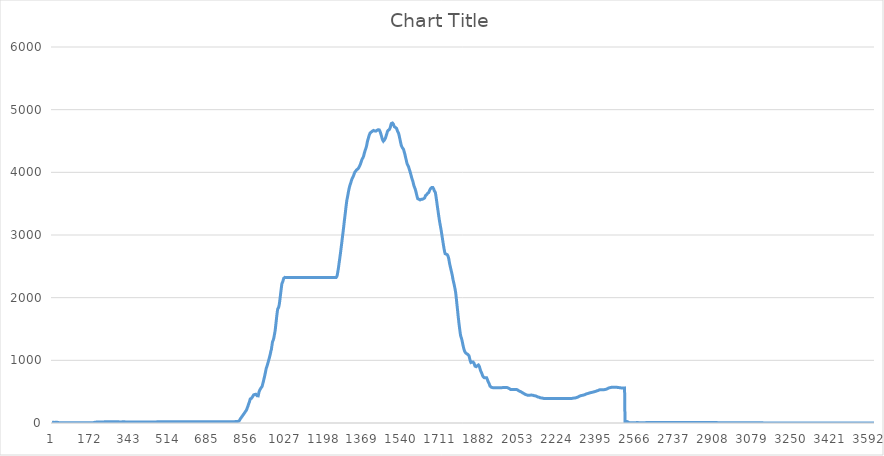
| Category | Series 0 |
|---|---|
| 0 | 10.916 |
| 1 | 10.916 |
| 2 | 10.835 |
| 3 | 11.635 |
| 4 | 10.758 |
| 5 | 10.685 |
| 6 | 9.806 |
| 7 | 9.771 |
| 8 | 9.588 |
| 9 | 9.514 |
| 10 | 9.471 |
| 11 | 9.471 |
| 12 | 9.471 |
| 13 | 9.435 |
| 14 | 10.467 |
| 15 | 11.403 |
| 16 | 11.433 |
| 17 | 12.513 |
| 18 | 13.428 |
| 19 | 13.624 |
| 20 | 13.709 |
| 21 | 13.753 |
| 22 | 13.797 |
| 23 | 13.318 |
| 24 | 12.328 |
| 25 | 8.7 |
| 26 | 7.608 |
| 27 | 5.782 |
| 28 | 5.558 |
| 29 | 5.574 |
| 30 | 5.574 |
| 31 | 4.757 |
| 32 | 5.592 |
| 33 | 5.612 |
| 34 | 4.781 |
| 35 | 4.781 |
| 36 | 4.781 |
| 37 | 5.612 |
| 38 | 4.781 |
| 39 | 4.781 |
| 40 | 4.781 |
| 41 | 4.781 |
| 42 | 4.781 |
| 43 | 4.781 |
| 44 | 4.781 |
| 45 | 4.781 |
| 46 | 4.781 |
| 47 | 4.808 |
| 48 | 4.808 |
| 49 | 4.808 |
| 50 | 4.808 |
| 51 | 4.808 |
| 52 | 4.808 |
| 53 | 4.808 |
| 54 | 4.808 |
| 55 | 4.808 |
| 56 | 4.808 |
| 57 | 4.808 |
| 58 | 4.808 |
| 59 | 4.808 |
| 60 | 4.837 |
| 61 | 4.837 |
| 62 | 4.837 |
| 63 | 4.837 |
| 64 | 4.837 |
| 65 | 4.837 |
| 66 | 4.837 |
| 67 | 4.837 |
| 68 | 4.837 |
| 69 | 4.837 |
| 70 | 4.837 |
| 71 | 4.837 |
| 72 | 4.837 |
| 73 | 4.837 |
| 74 | 4.837 |
| 75 | 4.837 |
| 76 | 4.837 |
| 77 | 4.837 |
| 78 | 4.837 |
| 79 | 4.837 |
| 80 | 4.837 |
| 81 | 4.837 |
| 82 | 4.837 |
| 83 | 4.837 |
| 84 | 4.837 |
| 85 | 4.837 |
| 86 | 4.837 |
| 87 | 4.837 |
| 88 | 4.837 |
| 89 | 4.837 |
| 90 | 4.837 |
| 91 | 4.837 |
| 92 | 4.837 |
| 93 | 4.837 |
| 94 | 4.837 |
| 95 | 4.837 |
| 96 | 4.837 |
| 97 | 4.837 |
| 98 | 4.837 |
| 99 | 4.837 |
| 100 | 4.837 |
| 101 | 4.837 |
| 102 | 4.837 |
| 103 | 4.837 |
| 104 | 4.837 |
| 105 | 4.837 |
| 106 | 4.837 |
| 107 | 4.837 |
| 108 | 4.837 |
| 109 | 4.837 |
| 110 | 4.837 |
| 111 | 4.837 |
| 112 | 4.837 |
| 113 | 4.837 |
| 114 | 4.837 |
| 115 | 4.837 |
| 116 | 4.837 |
| 117 | 4.837 |
| 118 | 4.837 |
| 119 | 4.837 |
| 120 | 4.837 |
| 121 | 4.837 |
| 122 | 4.837 |
| 123 | 4.837 |
| 124 | 4.837 |
| 125 | 4.837 |
| 126 | 4.837 |
| 127 | 4.837 |
| 128 | 4.837 |
| 129 | 4.837 |
| 130 | 4.837 |
| 131 | 4.837 |
| 132 | 4.837 |
| 133 | 4.837 |
| 134 | 4.837 |
| 135 | 4.837 |
| 136 | 4.837 |
| 137 | 4.837 |
| 138 | 4.837 |
| 139 | 4.837 |
| 140 | 4.837 |
| 141 | 4.837 |
| 142 | 4.837 |
| 143 | 4.837 |
| 144 | 4.837 |
| 145 | 4.837 |
| 146 | 4.837 |
| 147 | 4.837 |
| 148 | 4.837 |
| 149 | 4.837 |
| 150 | 4.837 |
| 151 | 4.837 |
| 152 | 4.837 |
| 153 | 4.837 |
| 154 | 4.837 |
| 155 | 4.837 |
| 156 | 4.837 |
| 157 | 4.837 |
| 158 | 4.837 |
| 159 | 4.837 |
| 160 | 4.837 |
| 161 | 4.837 |
| 162 | 4.837 |
| 163 | 4.837 |
| 164 | 4.837 |
| 165 | 4.837 |
| 166 | 4.837 |
| 167 | 4.837 |
| 168 | 4.808 |
| 169 | 4.808 |
| 170 | 4.808 |
| 171 | 4.808 |
| 172 | 4.837 |
| 173 | 4.837 |
| 174 | 4.837 |
| 175 | 4.837 |
| 176 | 4.837 |
| 177 | 4.837 |
| 178 | 4.903 |
| 179 | 5.21 |
| 180 | 5.21 |
| 181 | 6.34 |
| 182 | 6.985 |
| 183 | 6.985 |
| 184 | 8.528 |
| 185 | 9.938 |
| 186 | 11.707 |
| 187 | 11.707 |
| 188 | 12.394 |
| 189 | 13.534 |
| 190 | 13.534 |
| 191 | 14.031 |
| 192 | 14.626 |
| 193 | 14.541 |
| 194 | 14.541 |
| 195 | 14.42 |
| 196 | 14.343 |
| 197 | 14.343 |
| 198 | 14.343 |
| 199 | 15.114 |
| 200 | 15.114 |
| 201 | 15.114 |
| 202 | 15.114 |
| 203 | 15.148 |
| 204 | 15.148 |
| 205 | 15.148 |
| 206 | 15.148 |
| 207 | 15.148 |
| 208 | 15.148 |
| 209 | 15.114 |
| 210 | 15.114 |
| 211 | 16.332 |
| 212 | 16.332 |
| 213 | 16.364 |
| 214 | 16.364 |
| 215 | 16.3 |
| 216 | 16.332 |
| 217 | 16.332 |
| 218 | 16.269 |
| 219 | 16.239 |
| 220 | 16.239 |
| 221 | 16.21 |
| 222 | 17.06 |
| 223 | 17.06 |
| 224 | 17.06 |
| 225 | 17.032 |
| 226 | 17.806 |
| 227 | 17.806 |
| 228 | 17.806 |
| 229 | 17.782 |
| 230 | 18.613 |
| 231 | 18.613 |
| 232 | 18.59 |
| 233 | 18.568 |
| 234 | 18.568 |
| 235 | 18.526 |
| 236 | 18.526 |
| 237 | 18.526 |
| 238 | 18.526 |
| 239 | 18.547 |
| 240 | 18.547 |
| 241 | 18.547 |
| 242 | 18.526 |
| 243 | 18.568 |
| 244 | 18.568 |
| 245 | 19.362 |
| 246 | 19.381 |
| 247 | 20.18 |
| 248 | 20.18 |
| 249 | 20.163 |
| 250 | 20.146 |
| 251 | 20.146 |
| 252 | 20.146 |
| 253 | 20.129 |
| 254 | 20.129 |
| 255 | 20.129 |
| 256 | 20.955 |
| 257 | 20.955 |
| 258 | 20.955 |
| 259 | 20.955 |
| 260 | 20.94 |
| 261 | 20.94 |
| 262 | 20.94 |
| 263 | 20.94 |
| 264 | 20.94 |
| 265 | 20.94 |
| 266 | 20.94 |
| 267 | 20.94 |
| 268 | 20.94 |
| 269 | 20.94 |
| 270 | 20.07 |
| 271 | 20.07 |
| 272 | 20.033 |
| 273 | 19.167 |
| 274 | 19.157 |
| 275 | 19.157 |
| 276 | 20.002 |
| 277 | 20.012 |
| 278 | 20.012 |
| 279 | 20.867 |
| 280 | 20.839 |
| 281 | 20.839 |
| 282 | 19.97 |
| 283 | 19.945 |
| 284 | 19.948 |
| 285 | 19.948 |
| 286 | 19.977 |
| 287 | 20.071 |
| 288 | 20.071 |
| 289 | 19.423 |
| 290 | 18.791 |
| 291 | 18.791 |
| 292 | 18.604 |
| 293 | 17.901 |
| 294 | 17.901 |
| 295 | 17.901 |
| 296 | 17.945 |
| 297 | 17.945 |
| 298 | 17.945 |
| 299 | 17.945 |
| 300 | 17.901 |
| 301 | 17.901 |
| 302 | 17.945 |
| 303 | 17.945 |
| 304 | 17.945 |
| 305 | 17.945 |
| 306 | 17.261 |
| 307 | 18.13 |
| 308 | 18.13 |
| 309 | 18.178 |
| 310 | 18.275 |
| 311 | 18.275 |
| 312 | 18.275 |
| 313 | 18.226 |
| 314 | 18.178 |
| 315 | 18.178 |
| 316 | 18.178 |
| 317 | 18.178 |
| 318 | 18.178 |
| 319 | 18.13 |
| 320 | 18.13 |
| 321 | 18.083 |
| 322 | 18.083 |
| 323 | 18.083 |
| 324 | 17.261 |
| 325 | 17.261 |
| 326 | 17.31 |
| 327 | 17.261 |
| 328 | 17.12 |
| 329 | 17.12 |
| 330 | 17.12 |
| 331 | 17.213 |
| 332 | 17.213 |
| 333 | 17.31 |
| 334 | 17.31 |
| 335 | 17.31 |
| 336 | 17.359 |
| 337 | 17.46 |
| 338 | 17.31 |
| 339 | 17.31 |
| 340 | 17.359 |
| 341 | 16.062 |
| 342 | 16.062 |
| 343 | 16.011 |
| 344 | 15.962 |
| 345 | 15.962 |
| 346 | 15.912 |
| 347 | 15.815 |
| 348 | 15.768 |
| 349 | 15.768 |
| 350 | 15.722 |
| 351 | 15.676 |
| 352 | 15.676 |
| 353 | 15.631 |
| 354 | 15.631 |
| 355 | 15.631 |
| 356 | 15.631 |
| 357 | 15.587 |
| 358 | 15.587 |
| 359 | 15.587 |
| 360 | 15.587 |
| 361 | 15.631 |
| 362 | 15.631 |
| 363 | 15.631 |
| 364 | 15.631 |
| 365 | 14.805 |
| 366 | 14.805 |
| 367 | 14.805 |
| 368 | 14.759 |
| 369 | 14.759 |
| 370 | 14.759 |
| 371 | 14.714 |
| 372 | 14.714 |
| 373 | 14.67 |
| 374 | 14.67 |
| 375 | 14.626 |
| 376 | 14.626 |
| 377 | 14.626 |
| 378 | 14.583 |
| 379 | 14.583 |
| 380 | 14.541 |
| 381 | 14.541 |
| 382 | 14.541 |
| 383 | 14.541 |
| 384 | 14.541 |
| 385 | 14.541 |
| 386 | 14.541 |
| 387 | 14.541 |
| 388 | 14.541 |
| 389 | 14.5 |
| 390 | 14.5 |
| 391 | 14.5 |
| 392 | 14.5 |
| 393 | 14.46 |
| 394 | 14.46 |
| 395 | 14.46 |
| 396 | 14.46 |
| 397 | 14.46 |
| 398 | 14.46 |
| 399 | 14.46 |
| 400 | 14.46 |
| 401 | 14.46 |
| 402 | 14.5 |
| 403 | 14.46 |
| 404 | 14.46 |
| 405 | 14.46 |
| 406 | 14.46 |
| 407 | 14.46 |
| 408 | 14.5 |
| 409 | 14.46 |
| 410 | 14.46 |
| 411 | 14.46 |
| 412 | 14.46 |
| 413 | 14.46 |
| 414 | 14.46 |
| 415 | 14.5 |
| 416 | 14.5 |
| 417 | 14.46 |
| 418 | 14.46 |
| 419 | 14.5 |
| 420 | 14.5 |
| 421 | 14.5 |
| 422 | 14.5 |
| 423 | 14.5 |
| 424 | 14.5 |
| 425 | 14.46 |
| 426 | 14.46 |
| 427 | 14.5 |
| 428 | 14.5 |
| 429 | 14.5 |
| 430 | 14.5 |
| 431 | 14.5 |
| 432 | 14.5 |
| 433 | 14.5 |
| 434 | 14.5 |
| 435 | 14.5 |
| 436 | 14.5 |
| 437 | 14.5 |
| 438 | 14.5 |
| 439 | 14.5 |
| 440 | 14.46 |
| 441 | 14.46 |
| 442 | 14.46 |
| 443 | 14.46 |
| 444 | 14.42 |
| 445 | 14.42 |
| 446 | 14.42 |
| 447 | 14.382 |
| 448 | 14.382 |
| 449 | 14.42 |
| 450 | 15.222 |
| 451 | 15.222 |
| 452 | 15.222 |
| 453 | 15.222 |
| 454 | 16.467 |
| 455 | 16.467 |
| 456 | 16.575 |
| 457 | 17.491 |
| 458 | 17.491 |
| 459 | 17.567 |
| 460 | 18.483 |
| 461 | 18.604 |
| 462 | 18.604 |
| 463 | 19.479 |
| 464 | 19.562 |
| 465 | 19.562 |
| 466 | 19.647 |
| 467 | 19.69 |
| 468 | 19.69 |
| 469 | 19.734 |
| 470 | 19.734 |
| 471 | 19.734 |
| 472 | 19.734 |
| 473 | 19.779 |
| 474 | 19.779 |
| 475 | 19.779 |
| 476 | 19.824 |
| 477 | 19.824 |
| 478 | 19.824 |
| 479 | 19.824 |
| 480 | 19.869 |
| 481 | 19.869 |
| 482 | 19.869 |
| 483 | 19.824 |
| 484 | 19.869 |
| 485 | 19.869 |
| 486 | 19.869 |
| 487 | 19.869 |
| 488 | 19.869 |
| 489 | 19.869 |
| 490 | 19.869 |
| 491 | 19.869 |
| 492 | 19.869 |
| 493 | 19.869 |
| 494 | 19.824 |
| 495 | 19.824 |
| 496 | 19.869 |
| 497 | 19.824 |
| 498 | 19.824 |
| 499 | 19.824 |
| 500 | 19.824 |
| 501 | 19.824 |
| 502 | 19.824 |
| 503 | 19.824 |
| 504 | 19.824 |
| 505 | 19.824 |
| 506 | 19.824 |
| 507 | 19.779 |
| 508 | 19.779 |
| 509 | 19.779 |
| 510 | 19.779 |
| 511 | 18.999 |
| 512 | 18.999 |
| 513 | 18.999 |
| 514 | 19.046 |
| 515 | 19.046 |
| 516 | 19.046 |
| 517 | 19.046 |
| 518 | 19.046 |
| 519 | 19.046 |
| 520 | 19.046 |
| 521 | 19.046 |
| 522 | 19.046 |
| 523 | 19.046 |
| 524 | 19.046 |
| 525 | 19.046 |
| 526 | 19.046 |
| 527 | 19.094 |
| 528 | 19.094 |
| 529 | 19.094 |
| 530 | 19.094 |
| 531 | 19.094 |
| 532 | 19.094 |
| 533 | 19.094 |
| 534 | 19.094 |
| 535 | 19.094 |
| 536 | 19.094 |
| 537 | 19.094 |
| 538 | 19.094 |
| 539 | 19.094 |
| 540 | 19.094 |
| 541 | 19.094 |
| 542 | 19.094 |
| 543 | 19.094 |
| 544 | 19.094 |
| 545 | 19.094 |
| 546 | 19.094 |
| 547 | 19.094 |
| 548 | 19.094 |
| 549 | 19.094 |
| 550 | 19.142 |
| 551 | 19.142 |
| 552 | 19.142 |
| 553 | 19.142 |
| 554 | 19.142 |
| 555 | 19.142 |
| 556 | 19.142 |
| 557 | 19.142 |
| 558 | 19.142 |
| 559 | 19.142 |
| 560 | 19.142 |
| 561 | 19.142 |
| 562 | 19.142 |
| 563 | 19.142 |
| 564 | 19.142 |
| 565 | 19.142 |
| 566 | 19.142 |
| 567 | 19.142 |
| 568 | 19.142 |
| 569 | 19.142 |
| 570 | 19.142 |
| 571 | 19.142 |
| 572 | 19.142 |
| 573 | 19.142 |
| 574 | 19.142 |
| 575 | 19.142 |
| 576 | 19.142 |
| 577 | 19.142 |
| 578 | 19.142 |
| 579 | 19.142 |
| 580 | 19.142 |
| 581 | 19.142 |
| 582 | 19.142 |
| 583 | 19.142 |
| 584 | 19.142 |
| 585 | 19.142 |
| 586 | 19.142 |
| 587 | 19.142 |
| 588 | 19.142 |
| 589 | 19.142 |
| 590 | 18.324 |
| 591 | 18.324 |
| 592 | 18.324 |
| 593 | 18.324 |
| 594 | 18.324 |
| 595 | 18.324 |
| 596 | 18.324 |
| 597 | 19.094 |
| 598 | 19.094 |
| 599 | 19.094 |
| 600 | 19.094 |
| 601 | 19.094 |
| 602 | 19.094 |
| 603 | 19.046 |
| 604 | 19.046 |
| 605 | 19.046 |
| 606 | 18.324 |
| 607 | 18.324 |
| 608 | 18.324 |
| 609 | 18.324 |
| 610 | 18.374 |
| 611 | 18.425 |
| 612 | 18.425 |
| 613 | 18.425 |
| 614 | 18.477 |
| 615 | 18.477 |
| 616 | 18.477 |
| 617 | 18.477 |
| 618 | 18.477 |
| 619 | 18.477 |
| 620 | 18.477 |
| 621 | 18.477 |
| 622 | 18.477 |
| 623 | 18.477 |
| 624 | 18.477 |
| 625 | 18.529 |
| 626 | 18.529 |
| 627 | 18.529 |
| 628 | 18.529 |
| 629 | 18.529 |
| 630 | 18.529 |
| 631 | 18.581 |
| 632 | 18.581 |
| 633 | 18.581 |
| 634 | 18.581 |
| 635 | 18.581 |
| 636 | 18.581 |
| 637 | 18.581 |
| 638 | 18.581 |
| 639 | 18.581 |
| 640 | 18.581 |
| 641 | 18.581 |
| 642 | 18.581 |
| 643 | 18.581 |
| 644 | 18.581 |
| 645 | 18.581 |
| 646 | 18.581 |
| 647 | 18.581 |
| 648 | 18.581 |
| 649 | 18.581 |
| 650 | 18.581 |
| 651 | 18.581 |
| 652 | 18.581 |
| 653 | 18.581 |
| 654 | 18.581 |
| 655 | 18.581 |
| 656 | 18.581 |
| 657 | 18.581 |
| 658 | 18.581 |
| 659 | 18.581 |
| 660 | 18.581 |
| 661 | 18.581 |
| 662 | 18.581 |
| 663 | 18.581 |
| 664 | 18.581 |
| 665 | 18.581 |
| 666 | 18.581 |
| 667 | 18.581 |
| 668 | 18.581 |
| 669 | 18.581 |
| 670 | 18.581 |
| 671 | 18.581 |
| 672 | 18.581 |
| 673 | 18.581 |
| 674 | 18.581 |
| 675 | 18.581 |
| 676 | 18.581 |
| 677 | 18.581 |
| 678 | 18.581 |
| 679 | 18.581 |
| 680 | 18.581 |
| 681 | 18.581 |
| 682 | 18.581 |
| 683 | 18.581 |
| 684 | 18.581 |
| 685 | 18.581 |
| 686 | 18.581 |
| 687 | 18.581 |
| 688 | 18.581 |
| 689 | 18.581 |
| 690 | 18.581 |
| 691 | 18.581 |
| 692 | 18.581 |
| 693 | 18.581 |
| 694 | 18.581 |
| 695 | 18.581 |
| 696 | 18.581 |
| 697 | 18.581 |
| 698 | 18.581 |
| 699 | 18.581 |
| 700 | 18.581 |
| 701 | 18.581 |
| 702 | 18.581 |
| 703 | 18.581 |
| 704 | 18.581 |
| 705 | 18.633 |
| 706 | 18.741 |
| 707 | 18.741 |
| 708 | 18.741 |
| 709 | 18.796 |
| 710 | 18.796 |
| 711 | 18.796 |
| 712 | 18.796 |
| 713 | 18.796 |
| 714 | 18.796 |
| 715 | 18.852 |
| 716 | 18.908 |
| 717 | 18.852 |
| 718 | 18.852 |
| 719 | 18.908 |
| 720 | 18.964 |
| 721 | 18.964 |
| 722 | 19.02 |
| 723 | 18.287 |
| 724 | 18.287 |
| 725 | 18.287 |
| 726 | 18.964 |
| 727 | 18.964 |
| 728 | 18.964 |
| 729 | 18.964 |
| 730 | 18.964 |
| 731 | 18.964 |
| 732 | 18.964 |
| 733 | 18.964 |
| 734 | 19.02 |
| 735 | 19.02 |
| 736 | 19.02 |
| 737 | 19.02 |
| 738 | 19.02 |
| 739 | 19.02 |
| 740 | 19.02 |
| 741 | 19.02 |
| 742 | 19.02 |
| 743 | 19.02 |
| 744 | 19.02 |
| 745 | 19.02 |
| 746 | 19.02 |
| 747 | 19.02 |
| 748 | 19.02 |
| 749 | 19.02 |
| 750 | 19.02 |
| 751 | 19.02 |
| 752 | 19.02 |
| 753 | 19.763 |
| 754 | 19.763 |
| 755 | 19.763 |
| 756 | 19.763 |
| 757 | 19.763 |
| 758 | 19.763 |
| 759 | 19.763 |
| 760 | 19.763 |
| 761 | 19.763 |
| 762 | 19.763 |
| 763 | 19.763 |
| 764 | 19.818 |
| 765 | 19.818 |
| 766 | 19.818 |
| 767 | 19.818 |
| 768 | 19.818 |
| 769 | 19.818 |
| 770 | 19.818 |
| 771 | 19.818 |
| 772 | 19.818 |
| 773 | 19.818 |
| 774 | 19.818 |
| 775 | 19.818 |
| 776 | 19.818 |
| 777 | 19.818 |
| 778 | 19.818 |
| 779 | 19.818 |
| 780 | 19.818 |
| 781 | 19.818 |
| 782 | 19.818 |
| 783 | 19.818 |
| 784 | 19.818 |
| 785 | 19.818 |
| 786 | 19.818 |
| 787 | 19.818 |
| 788 | 19.818 |
| 789 | 19.818 |
| 790 | 19.818 |
| 791 | 19.818 |
| 792 | 19.818 |
| 793 | 19.818 |
| 794 | 19.818 |
| 795 | 19.874 |
| 796 | 19.988 |
| 797 | 19.988 |
| 798 | 20.841 |
| 799 | 20.954 |
| 800 | 20.954 |
| 801 | 21.752 |
| 802 | 22.554 |
| 803 | 23.255 |
| 804 | 23.255 |
| 805 | 23.868 |
| 806 | 24.843 |
| 807 | 24.843 |
| 808 | 25.457 |
| 809 | 25.375 |
| 810 | 25.375 |
| 811 | 25.457 |
| 812 | 24.934 |
| 813 | 24.38 |
| 814 | 24.38 |
| 815 | 24.903 |
| 816 | 26.106 |
| 817 | 26.106 |
| 818 | 28.025 |
| 819 | 31.307 |
| 820 | 31.307 |
| 821 | 36.603 |
| 822 | 42.548 |
| 823 | 48.787 |
| 824 | 48.787 |
| 825 | 55.33 |
| 826 | 68.626 |
| 827 | 75.351 |
| 828 | 75.351 |
| 829 | 81.894 |
| 830 | 88.567 |
| 831 | 95.503 |
| 832 | 95.503 |
| 833 | 102.362 |
| 834 | 109.34 |
| 835 | 109.34 |
| 836 | 116.736 |
| 837 | 122.978 |
| 838 | 129.672 |
| 839 | 129.672 |
| 840 | 135.751 |
| 841 | 142.178 |
| 842 | 142.178 |
| 843 | 156.019 |
| 844 | 163.28 |
| 845 | 170.104 |
| 846 | 170.104 |
| 847 | 177.152 |
| 848 | 183.824 |
| 849 | 190.454 |
| 850 | 190.454 |
| 851 | 198.071 |
| 852 | 205.02 |
| 853 | 205.02 |
| 854 | 219.043 |
| 855 | 232.044 |
| 856 | 241.986 |
| 857 | 247.097 |
| 858 | 254.984 |
| 859 | 267.632 |
| 860 | 281.2 |
| 861 | 293.487 |
| 862 | 307.181 |
| 863 | 315.411 |
| 864 | 323.33 |
| 865 | 332.115 |
| 866 | 340.83 |
| 867 | 357.481 |
| 868 | 372.42 |
| 869 | 383.523 |
| 870 | 390.8 |
| 871 | 392.897 |
| 872 | 392.897 |
| 873 | 392.897 |
| 874 | 392.8 |
| 875 | 396.195 |
| 876 | 402.034 |
| 877 | 407.309 |
| 878 | 412.935 |
| 879 | 417.461 |
| 880 | 423.332 |
| 881 | 430.007 |
| 882 | 436.459 |
| 883 | 443.318 |
| 884 | 448.9 |
| 885 | 451.695 |
| 886 | 452.714 |
| 887 | 453.723 |
| 888 | 455.415 |
| 889 | 456.098 |
| 890 | 457.347 |
| 891 | 462.294 |
| 892 | 463.326 |
| 893 | 460.283 |
| 894 | 458.281 |
| 895 | 456.911 |
| 896 | 454.706 |
| 897 | 450.056 |
| 898 | 442.404 |
| 899 | 434.957 |
| 900 | 434.957 |
| 901 | 428.708 |
| 902 | 424.906 |
| 903 | 424.25 |
| 904 | 433.123 |
| 905 | 450.162 |
| 906 | 469.073 |
| 907 | 486.25 |
| 908 | 499.199 |
| 909 | 508.774 |
| 910 | 516.852 |
| 911 | 525.914 |
| 912 | 532.948 |
| 913 | 539.316 |
| 914 | 545.83 |
| 915 | 552.884 |
| 916 | 559.008 |
| 917 | 563.368 |
| 918 | 566.586 |
| 919 | 568.86 |
| 920 | 574.272 |
| 921 | 583.11 |
| 922 | 594.225 |
| 923 | 609.222 |
| 924 | 625.457 |
| 925 | 638.059 |
| 926 | 651.629 |
| 927 | 667.161 |
| 928 | 683.322 |
| 929 | 698.823 |
| 930 | 713.825 |
| 931 | 727.819 |
| 932 | 744.552 |
| 933 | 761.116 |
| 934 | 779.584 |
| 935 | 796.156 |
| 936 | 814.787 |
| 937 | 833.064 |
| 938 | 850.966 |
| 939 | 866.539 |
| 940 | 881.764 |
| 941 | 894.913 |
| 942 | 900.77 |
| 943 | 912.917 |
| 944 | 924.755 |
| 945 | 937.661 |
| 946 | 949.833 |
| 947 | 962.086 |
| 948 | 975.243 |
| 949 | 988.923 |
| 950 | 1001.543 |
| 951 | 1014.277 |
| 952 | 1027.075 |
| 953 | 1040.724 |
| 954 | 1054.86 |
| 955 | 1069.466 |
| 956 | 1084.127 |
| 957 | 1099.299 |
| 958 | 1116.046 |
| 959 | 1134.532 |
| 960 | 1155.309 |
| 961 | 1167.005 |
| 962 | 1176.635 |
| 963 | 1206.031 |
| 964 | 1229.164 |
| 965 | 1253.355 |
| 966 | 1278.467 |
| 967 | 1297.769 |
| 968 | 1305.938 |
| 969 | 1312.348 |
| 970 | 1322.239 |
| 971 | 1334.331 |
| 972 | 1350.105 |
| 973 | 1367.54 |
| 974 | 1386.568 |
| 975 | 1406.116 |
| 976 | 1425.339 |
| 977 | 1445.899 |
| 978 | 1466.541 |
| 979 | 1494.22 |
| 980 | 1526.216 |
| 981 | 1559.894 |
| 982 | 1592.366 |
| 983 | 1625.89 |
| 984 | 1660.134 |
| 985 | 1692.732 |
| 986 | 1724.628 |
| 987 | 1754.362 |
| 988 | 1782.629 |
| 989 | 1804.253 |
| 990 | 1822.596 |
| 991 | 1830.2 |
| 992 | 1834.736 |
| 993 | 1841.013 |
| 994 | 1851.127 |
| 995 | 1866.09 |
| 996 | 1884.134 |
| 997 | 1908.778 |
| 998 | 1932.491 |
| 999 | 1962.69 |
| 1000 | 1992.354 |
| 1001 | 2022.835 |
| 1002 | 2053.254 |
| 1003 | 2081.628 |
| 1004 | 2112.041 |
| 1005 | 2140.301 |
| 1006 | 2169.488 |
| 1007 | 2198.556 |
| 1008 | 2224.143 |
| 1009 | 2224.143 |
| 1010 | 2240.93 |
| 1011 | 2253.743 |
| 1012 | 2258.832 |
| 1013 | 2271.719 |
| 1014 | 2284.691 |
| 1015 | 2296.834 |
| 1016 | 2309.92 |
| 1017 | 2316.891 |
| 1018 | 2320.501 |
| 1019 | 2320.501 |
| 1020 | 2323.191 |
| 1021 | 2323.916 |
| 1022 | 2325.986 |
| 1023 | 2323.861 |
| 1024 | 2320.869 |
| 1025 | 2320.869 |
| 1026 | 2320.745 |
| 1027 | 2320.914 |
| 1028 | 2320.914 |
| 1029 | 2320.971 |
| 1030 | 2320.971 |
| 1031 | 2320.971 |
| 1032 | 2320.914 |
| 1033 | 2320.914 |
| 1034 | 2320.914 |
| 1035 | 2320.914 |
| 1036 | 2320.914 |
| 1037 | 2320.914 |
| 1038 | 2320.914 |
| 1039 | 2320.914 |
| 1040 | 2320.914 |
| 1041 | 2320.914 |
| 1042 | 2320.914 |
| 1043 | 2320.914 |
| 1044 | 2320.914 |
| 1045 | 2320.914 |
| 1046 | 2320.914 |
| 1047 | 2320.914 |
| 1048 | 2320.914 |
| 1049 | 2320.914 |
| 1050 | 2320.914 |
| 1051 | 2320.914 |
| 1052 | 2320.914 |
| 1053 | 2320.914 |
| 1054 | 2320.914 |
| 1055 | 2320.914 |
| 1056 | 2320.914 |
| 1057 | 2320.858 |
| 1058 | 2320.858 |
| 1059 | 2320.858 |
| 1060 | 2320.858 |
| 1061 | 2320.914 |
| 1062 | 2320.914 |
| 1063 | 2320.914 |
| 1064 | 2320.858 |
| 1065 | 2320.858 |
| 1066 | 2320.858 |
| 1067 | 2320.858 |
| 1068 | 2320.858 |
| 1069 | 2320.858 |
| 1070 | 2320.858 |
| 1071 | 2320.858 |
| 1072 | 2320.858 |
| 1073 | 2320.858 |
| 1074 | 2320.858 |
| 1075 | 2320.858 |
| 1076 | 2320.858 |
| 1077 | 2320.858 |
| 1078 | 2320.858 |
| 1079 | 2320.858 |
| 1080 | 2320.858 |
| 1081 | 2320.858 |
| 1082 | 2320.858 |
| 1083 | 2320.858 |
| 1084 | 2320.858 |
| 1085 | 2320.858 |
| 1086 | 2320.858 |
| 1087 | 2320.858 |
| 1088 | 2320.858 |
| 1089 | 2320.858 |
| 1090 | 2320.858 |
| 1091 | 2320.858 |
| 1092 | 2320.858 |
| 1093 | 2320.858 |
| 1094 | 2320.858 |
| 1095 | 2320.858 |
| 1096 | 2320.858 |
| 1097 | 2320.858 |
| 1098 | 2320.858 |
| 1099 | 2320.858 |
| 1100 | 2320.858 |
| 1101 | 2320.858 |
| 1102 | 2320.858 |
| 1103 | 2320.858 |
| 1104 | 2320.858 |
| 1105 | 2320.858 |
| 1106 | 2320.858 |
| 1107 | 2320.858 |
| 1108 | 2320.858 |
| 1109 | 2320.858 |
| 1110 | 2320.858 |
| 1111 | 2320.858 |
| 1112 | 2320.858 |
| 1113 | 2320.858 |
| 1114 | 2320.858 |
| 1115 | 2320.858 |
| 1116 | 2320.858 |
| 1117 | 2320.858 |
| 1118 | 2320.858 |
| 1119 | 2320.858 |
| 1120 | 2320.858 |
| 1121 | 2320.858 |
| 1122 | 2320.858 |
| 1123 | 2320.858 |
| 1124 | 2320.858 |
| 1125 | 2320.858 |
| 1126 | 2320.858 |
| 1127 | 2320.858 |
| 1128 | 2320.858 |
| 1129 | 2320.858 |
| 1130 | 2320.858 |
| 1131 | 2320.858 |
| 1132 | 2320.858 |
| 1133 | 2320.858 |
| 1134 | 2320.858 |
| 1135 | 2320.858 |
| 1136 | 2320.858 |
| 1137 | 2320.858 |
| 1138 | 2320.858 |
| 1139 | 2320.858 |
| 1140 | 2320.858 |
| 1141 | 2320.858 |
| 1142 | 2320.858 |
| 1143 | 2320.858 |
| 1144 | 2320.858 |
| 1145 | 2320.858 |
| 1146 | 2320.858 |
| 1147 | 2320.801 |
| 1148 | 2320.801 |
| 1149 | 2320.801 |
| 1150 | 2320.801 |
| 1151 | 2320.801 |
| 1152 | 2320.801 |
| 1153 | 2320.801 |
| 1154 | 2320.801 |
| 1155 | 2320.801 |
| 1156 | 2320.801 |
| 1157 | 2320.801 |
| 1158 | 2320.801 |
| 1159 | 2320.801 |
| 1160 | 2320.801 |
| 1161 | 2320.801 |
| 1162 | 2320.801 |
| 1163 | 2320.801 |
| 1164 | 2320.801 |
| 1165 | 2320.801 |
| 1166 | 2320.801 |
| 1167 | 2320.801 |
| 1168 | 2320.801 |
| 1169 | 2320.801 |
| 1170 | 2320.801 |
| 1171 | 2320.801 |
| 1172 | 2320.801 |
| 1173 | 2320.801 |
| 1174 | 2320.801 |
| 1175 | 2320.801 |
| 1176 | 2320.801 |
| 1177 | 2320.801 |
| 1178 | 2320.801 |
| 1179 | 2320.801 |
| 1180 | 2320.801 |
| 1181 | 2320.801 |
| 1182 | 2320.801 |
| 1183 | 2320.801 |
| 1184 | 2320.801 |
| 1185 | 2320.801 |
| 1186 | 2320.801 |
| 1187 | 2320.801 |
| 1188 | 2320.801 |
| 1189 | 2320.801 |
| 1190 | 2320.801 |
| 1191 | 2320.801 |
| 1192 | 2320.801 |
| 1193 | 2320.801 |
| 1194 | 2320.801 |
| 1195 | 2320.801 |
| 1196 | 2320.801 |
| 1197 | 2320.801 |
| 1198 | 2320.801 |
| 1199 | 2320.801 |
| 1200 | 2320.801 |
| 1201 | 2320.801 |
| 1202 | 2320.801 |
| 1203 | 2320.801 |
| 1204 | 2320.801 |
| 1205 | 2320.801 |
| 1206 | 2320.801 |
| 1207 | 2320.801 |
| 1208 | 2320.801 |
| 1209 | 2320.801 |
| 1210 | 2320.801 |
| 1211 | 2320.801 |
| 1212 | 2320.801 |
| 1213 | 2320.801 |
| 1214 | 2320.801 |
| 1215 | 2320.801 |
| 1216 | 2320.801 |
| 1217 | 2320.801 |
| 1218 | 2320.801 |
| 1219 | 2320.801 |
| 1220 | 2320.801 |
| 1221 | 2320.801 |
| 1222 | 2320.801 |
| 1223 | 2320.801 |
| 1224 | 2320.801 |
| 1225 | 2320.801 |
| 1226 | 2320.801 |
| 1227 | 2320.801 |
| 1228 | 2320.801 |
| 1229 | 2320.801 |
| 1230 | 2320.801 |
| 1231 | 2320.801 |
| 1232 | 2320.801 |
| 1233 | 2320.801 |
| 1234 | 2320.801 |
| 1235 | 2320.801 |
| 1236 | 2320.801 |
| 1237 | 2320.801 |
| 1238 | 2321.365 |
| 1239 | 2322.322 |
| 1240 | 2322.838 |
| 1241 | 2322.614 |
| 1242 | 2322.154 |
| 1243 | 2322.487 |
| 1244 | 2322.032 |
| 1245 | 2322.074 |
| 1246 | 2323.059 |
| 1247 | 2325.984 |
| 1248 | 2330.123 |
| 1249 | 2339.953 |
| 1250 | 2347.009 |
| 1251 | 2364.303 |
| 1252 | 2386.088 |
| 1253 | 2406.937 |
| 1254 | 2431.141 |
| 1255 | 2452.139 |
| 1256 | 2474.363 |
| 1257 | 2501.513 |
| 1258 | 2529.109 |
| 1259 | 2556.633 |
| 1260 | 2583.152 |
| 1261 | 2608.736 |
| 1262 | 2634.467 |
| 1263 | 2660.445 |
| 1264 | 2688.405 |
| 1265 | 2715.124 |
| 1266 | 2744.348 |
| 1267 | 2773.79 |
| 1268 | 2802.018 |
| 1269 | 2831.089 |
| 1270 | 2859.275 |
| 1271 | 2889.119 |
| 1272 | 2922.613 |
| 1273 | 2952.507 |
| 1274 | 2983.176 |
| 1275 | 3010.988 |
| 1276 | 3040.159 |
| 1277 | 3069.845 |
| 1278 | 3101.155 |
| 1279 | 3131.955 |
| 1280 | 3163.426 |
| 1281 | 3197.545 |
| 1282 | 3228.813 |
| 1283 | 3259.128 |
| 1284 | 3289.559 |
| 1285 | 3320.431 |
| 1286 | 3350.059 |
| 1287 | 3382.826 |
| 1288 | 3415.301 |
| 1289 | 3445.896 |
| 1290 | 3475.417 |
| 1291 | 3505.184 |
| 1292 | 3532.999 |
| 1293 | 3556.741 |
| 1294 | 3577.138 |
| 1295 | 3594.706 |
| 1296 | 3613.014 |
| 1297 | 3631.746 |
| 1298 | 3651.289 |
| 1299 | 3672.901 |
| 1300 | 3691.939 |
| 1301 | 3710.033 |
| 1302 | 3727.755 |
| 1303 | 3744.291 |
| 1304 | 3760.475 |
| 1305 | 3776.17 |
| 1306 | 3787.251 |
| 1307 | 3798.095 |
| 1308 | 3810.507 |
| 1309 | 3823.151 |
| 1310 | 3833.336 |
| 1311 | 3844.209 |
| 1312 | 3856.363 |
| 1313 | 3869.649 |
| 1314 | 3882.094 |
| 1315 | 3893.022 |
| 1316 | 3900.757 |
| 1317 | 3906.925 |
| 1318 | 3913.171 |
| 1319 | 3919.705 |
| 1320 | 3927.104 |
| 1321 | 3935.572 |
| 1322 | 3945.314 |
| 1323 | 3955.04 |
| 1324 | 3964.93 |
| 1325 | 3975.429 |
| 1326 | 3985.622 |
| 1327 | 3995.041 |
| 1328 | 4002.847 |
| 1329 | 4008.522 |
| 1330 | 4013.304 |
| 1331 | 4018.299 |
| 1332 | 4022.556 |
| 1333 | 4026.546 |
| 1334 | 4030.522 |
| 1335 | 4035.702 |
| 1336 | 4040.44 |
| 1337 | 4042.356 |
| 1338 | 4046.276 |
| 1339 | 4049.332 |
| 1340 | 4052.057 |
| 1341 | 4053.147 |
| 1342 | 4056.173 |
| 1343 | 4061.37 |
| 1344 | 4068.163 |
| 1345 | 4073.987 |
| 1346 | 4081.141 |
| 1347 | 4087.781 |
| 1348 | 4094.374 |
| 1349 | 4102.492 |
| 1350 | 4112.023 |
| 1351 | 4120.736 |
| 1352 | 4127.094 |
| 1353 | 4135.618 |
| 1354 | 4146.689 |
| 1355 | 4159.104 |
| 1356 | 4170.161 |
| 1357 | 4181.375 |
| 1358 | 4192.449 |
| 1359 | 4202.018 |
| 1360 | 4209.832 |
| 1361 | 4218.137 |
| 1362 | 4223.21 |
| 1363 | 4231.116 |
| 1364 | 4237.333 |
| 1365 | 4244.974 |
| 1366 | 4255.971 |
| 1367 | 4270.354 |
| 1368 | 4282.582 |
| 1369 | 4297.039 |
| 1370 | 4311.776 |
| 1371 | 4323.582 |
| 1372 | 4336.557 |
| 1373 | 4350.54 |
| 1374 | 4360.885 |
| 1375 | 4369.507 |
| 1376 | 4378.716 |
| 1377 | 4389.399 |
| 1378 | 4402.655 |
| 1379 | 4416.64 |
| 1380 | 4433.62 |
| 1381 | 4453.103 |
| 1382 | 4472.464 |
| 1383 | 4489.829 |
| 1384 | 4504.139 |
| 1385 | 4519.207 |
| 1386 | 4528.452 |
| 1387 | 4541.709 |
| 1388 | 4555.213 |
| 1389 | 4569.672 |
| 1390 | 4581.317 |
| 1391 | 4592.126 |
| 1392 | 4600.678 |
| 1393 | 4610.775 |
| 1394 | 4619.618 |
| 1395 | 4627.963 |
| 1396 | 4634.98 |
| 1397 | 4639.207 |
| 1398 | 4640.783 |
| 1399 | 4640.755 |
| 1400 | 4642.764 |
| 1401 | 4645.497 |
| 1402 | 4650.58 |
| 1403 | 4652.295 |
| 1404 | 4657.145 |
| 1405 | 4657.313 |
| 1406 | 4660.458 |
| 1407 | 4667.995 |
| 1408 | 4669.129 |
| 1409 | 4669.965 |
| 1410 | 4668.404 |
| 1411 | 4663.664 |
| 1412 | 4664.901 |
| 1413 | 4668.057 |
| 1414 | 4663.884 |
| 1415 | 4659.781 |
| 1416 | 4657.23 |
| 1417 | 4656.099 |
| 1418 | 4656.226 |
| 1419 | 4656.679 |
| 1420 | 4657.5 |
| 1421 | 4657.76 |
| 1422 | 4659.712 |
| 1423 | 4660.625 |
| 1424 | 4665.674 |
| 1425 | 4669.831 |
| 1426 | 4674.547 |
| 1427 | 4679.219 |
| 1428 | 4678.593 |
| 1429 | 4678.896 |
| 1430 | 4678.903 |
| 1431 | 4681.134 |
| 1432 | 4681.277 |
| 1433 | 4680.205 |
| 1434 | 4677.802 |
| 1435 | 4677.247 |
| 1436 | 4672.736 |
| 1437 | 4667.218 |
| 1438 | 4656.575 |
| 1439 | 4647.772 |
| 1440 | 4636.742 |
| 1441 | 4623.921 |
| 1442 | 4612.791 |
| 1443 | 4600.84 |
| 1444 | 4587.132 |
| 1445 | 4574.291 |
| 1446 | 4561.194 |
| 1447 | 4547.789 |
| 1448 | 4535.011 |
| 1449 | 4523.661 |
| 1450 | 4514.709 |
| 1451 | 4505.999 |
| 1452 | 4500.014 |
| 1453 | 4497.135 |
| 1454 | 4496.885 |
| 1455 | 4501.883 |
| 1456 | 4507.382 |
| 1457 | 4513.064 |
| 1458 | 4517.86 |
| 1459 | 4522.749 |
| 1460 | 4529.847 |
| 1461 | 4537.021 |
| 1462 | 4545.562 |
| 1463 | 4556.47 |
| 1464 | 4567.798 |
| 1465 | 4579.715 |
| 1466 | 4592.114 |
| 1467 | 4605.868 |
| 1468 | 4616.188 |
| 1469 | 4627.116 |
| 1470 | 4640.093 |
| 1471 | 4652.544 |
| 1472 | 4663.06 |
| 1473 | 4666.182 |
| 1474 | 4669.511 |
| 1475 | 4670.694 |
| 1476 | 4671.544 |
| 1477 | 4673.033 |
| 1478 | 4676.815 |
| 1479 | 4681.817 |
| 1480 | 4686.837 |
| 1481 | 4693.237 |
| 1482 | 4702.492 |
| 1483 | 4713.597 |
| 1484 | 4726.88 |
| 1485 | 4742.666 |
| 1486 | 4758.938 |
| 1487 | 4770.667 |
| 1488 | 4779.177 |
| 1489 | 4783.632 |
| 1490 | 4785.818 |
| 1491 | 4786.529 |
| 1492 | 4786.879 |
| 1493 | 4787.104 |
| 1494 | 4787.038 |
| 1495 | 4784.593 |
| 1496 | 4779.032 |
| 1497 | 4769.388 |
| 1498 | 4758.077 |
| 1499 | 4745.875 |
| 1500 | 4735.702 |
| 1501 | 4729.151 |
| 1502 | 4728.388 |
| 1503 | 4727.624 |
| 1504 | 4726.523 |
| 1505 | 4721.957 |
| 1506 | 4716.998 |
| 1507 | 4714.557 |
| 1508 | 4714.585 |
| 1509 | 4713.401 |
| 1510 | 4708.728 |
| 1511 | 4700.342 |
| 1512 | 4689.464 |
| 1513 | 4678.536 |
| 1514 | 4667.133 |
| 1515 | 4658.195 |
| 1516 | 4650.353 |
| 1517 | 4643.413 |
| 1518 | 4636.852 |
| 1519 | 4630.366 |
| 1520 | 4619.612 |
| 1521 | 4606.062 |
| 1522 | 4590.168 |
| 1523 | 4573.92 |
| 1524 | 4557.029 |
| 1525 | 4539.949 |
| 1526 | 4522.906 |
| 1527 | 4506.146 |
| 1528 | 4488.367 |
| 1529 | 4471.203 |
| 1530 | 4455.062 |
| 1531 | 4439.179 |
| 1532 | 4425.251 |
| 1533 | 4415.704 |
| 1534 | 4409.261 |
| 1535 | 4400.837 |
| 1536 | 4394.079 |
| 1537 | 4388.26 |
| 1538 | 4386.661 |
| 1539 | 4384.483 |
| 1540 | 4379.654 |
| 1541 | 4369.909 |
| 1542 | 4358.624 |
| 1543 | 4346.234 |
| 1544 | 4333.06 |
| 1545 | 4319.942 |
| 1546 | 4308.419 |
| 1547 | 4294.209 |
| 1548 | 4278.207 |
| 1549 | 4261.999 |
| 1550 | 4245.244 |
| 1551 | 4231.063 |
| 1552 | 4215.92 |
| 1553 | 4201.057 |
| 1554 | 4186.348 |
| 1555 | 4166.636 |
| 1556 | 4151.073 |
| 1557 | 4138.071 |
| 1558 | 4127.79 |
| 1559 | 4121.422 |
| 1560 | 4115.981 |
| 1561 | 4105.863 |
| 1562 | 4101.932 |
| 1563 | 4088.471 |
| 1564 | 4083.439 |
| 1565 | 4073.277 |
| 1566 | 4056.497 |
| 1567 | 4045.262 |
| 1568 | 4034.325 |
| 1569 | 4024.086 |
| 1570 | 4011.493 |
| 1571 | 3998.242 |
| 1572 | 3985.498 |
| 1573 | 3972.713 |
| 1574 | 3959.453 |
| 1575 | 3944.517 |
| 1576 | 3930.949 |
| 1577 | 3916.646 |
| 1578 | 3904.757 |
| 1579 | 3892.115 |
| 1580 | 3882.176 |
| 1581 | 3871.461 |
| 1582 | 3860.905 |
| 1583 | 3848.018 |
| 1584 | 3833.123 |
| 1585 | 3816.448 |
| 1586 | 3801.29 |
| 1587 | 3788.076 |
| 1588 | 3776.155 |
| 1589 | 3768.141 |
| 1590 | 3759.401 |
| 1591 | 3749.634 |
| 1592 | 3740.028 |
| 1593 | 3729.127 |
| 1594 | 3717.49 |
| 1595 | 3703.936 |
| 1596 | 3689.302 |
| 1597 | 3674.171 |
| 1598 | 3657.161 |
| 1599 | 3643.63 |
| 1600 | 3628.66 |
| 1601 | 3615.667 |
| 1602 | 3600.087 |
| 1603 | 3587.253 |
| 1604 | 3578.155 |
| 1605 | 3573.916 |
| 1606 | 3573.328 |
| 1607 | 3574.862 |
| 1608 | 3573.559 |
| 1609 | 3570.127 |
| 1610 | 3567.273 |
| 1611 | 3565.142 |
| 1612 | 3563.341 |
| 1613 | 3561.131 |
| 1614 | 3559.697 |
| 1615 | 3559.038 |
| 1616 | 3559.029 |
| 1617 | 3563.368 |
| 1618 | 3566.451 |
| 1619 | 3569.156 |
| 1620 | 3570.322 |
| 1621 | 3570.108 |
| 1622 | 3570.269 |
| 1623 | 3569.035 |
| 1624 | 3569.403 |
| 1625 | 3569.914 |
| 1626 | 3571.727 |
| 1627 | 3573.744 |
| 1628 | 3576.609 |
| 1629 | 3578.479 |
| 1630 | 3580.346 |
| 1631 | 3582.665 |
| 1632 | 3585.725 |
| 1633 | 3588.678 |
| 1634 | 3592.201 |
| 1635 | 3599.34 |
| 1636 | 3609.336 |
| 1637 | 3620.248 |
| 1638 | 3629.501 |
| 1639 | 3635.866 |
| 1640 | 3637.173 |
| 1641 | 3639.212 |
| 1642 | 3640.344 |
| 1643 | 3644.36 |
| 1644 | 3650.461 |
| 1645 | 3654.77 |
| 1646 | 3659.451 |
| 1647 | 3664.447 |
| 1648 | 3669.677 |
| 1649 | 3671.717 |
| 1650 | 3673.084 |
| 1651 | 3674.164 |
| 1652 | 3678.248 |
| 1653 | 3683.809 |
| 1654 | 3692.608 |
| 1655 | 3704.141 |
| 1656 | 3713.239 |
| 1657 | 3722.587 |
| 1658 | 3730.516 |
| 1659 | 3736.279 |
| 1660 | 3740.978 |
| 1661 | 3745.445 |
| 1662 | 3749.665 |
| 1663 | 3753.842 |
| 1664 | 3755.688 |
| 1665 | 3756.958 |
| 1666 | 3757.99 |
| 1667 | 3757.881 |
| 1668 | 3757.99 |
| 1669 | 3757.99 |
| 1670 | 3757.99 |
| 1671 | 3758.099 |
| 1672 | 3755.869 |
| 1673 | 3746.276 |
| 1674 | 3732.91 |
| 1675 | 3719.693 |
| 1676 | 3710.004 |
| 1677 | 3705.615 |
| 1678 | 3704.745 |
| 1679 | 3703.439 |
| 1680 | 3694.659 |
| 1681 | 3678.191 |
| 1682 | 3658.351 |
| 1683 | 3634.753 |
| 1684 | 3612.439 |
| 1685 | 3586.297 |
| 1686 | 3561.326 |
| 1687 | 3534.81 |
| 1688 | 3510.114 |
| 1689 | 3478.663 |
| 1690 | 3453.78 |
| 1691 | 3429.104 |
| 1692 | 3403.767 |
| 1693 | 3380.388 |
| 1694 | 3354.139 |
| 1695 | 3327.052 |
| 1696 | 3301.75 |
| 1697 | 3278.604 |
| 1698 | 3253.425 |
| 1699 | 3228.974 |
| 1700 | 3208.631 |
| 1701 | 3186.684 |
| 1702 | 3167.232 |
| 1703 | 3147.445 |
| 1704 | 3126.449 |
| 1705 | 3106.637 |
| 1706 | 3085.94 |
| 1707 | 3063.817 |
| 1708 | 3040.693 |
| 1709 | 3017.166 |
| 1710 | 2992.308 |
| 1711 | 2970.307 |
| 1712 | 2945.439 |
| 1713 | 2922.852 |
| 1714 | 2899.762 |
| 1715 | 2875.519 |
| 1716 | 2853.133 |
| 1717 | 2830.691 |
| 1718 | 2807.523 |
| 1719 | 2785.771 |
| 1720 | 2765.691 |
| 1721 | 2748.107 |
| 1722 | 2726.381 |
| 1723 | 2712.312 |
| 1724 | 2701.591 |
| 1725 | 2696.045 |
| 1726 | 2693.374 |
| 1727 | 2693.517 |
| 1728 | 2693.517 |
| 1729 | 2693.517 |
| 1730 | 2693.412 |
| 1731 | 2693.412 |
| 1732 | 2692.149 |
| 1733 | 2687.873 |
| 1734 | 2683.558 |
| 1735 | 2679.035 |
| 1736 | 2670.625 |
| 1737 | 2659.76 |
| 1738 | 2647.402 |
| 1739 | 2633.874 |
| 1740 | 2617.739 |
| 1741 | 2599.038 |
| 1742 | 2576.092 |
| 1743 | 2555.577 |
| 1744 | 2537.296 |
| 1745 | 2518.791 |
| 1746 | 2502.912 |
| 1747 | 2487.728 |
| 1748 | 2471.634 |
| 1749 | 2455.201 |
| 1750 | 2439.172 |
| 1751 | 2424.698 |
| 1752 | 2410.031 |
| 1753 | 2393.385 |
| 1754 | 2377.233 |
| 1755 | 2360.918 |
| 1756 | 2342.349 |
| 1757 | 2320.739 |
| 1758 | 2300.128 |
| 1759 | 2280.706 |
| 1760 | 2264.696 |
| 1761 | 2248.993 |
| 1762 | 2234.412 |
| 1763 | 2218.64 |
| 1764 | 2200.937 |
| 1765 | 2182.449 |
| 1766 | 2164.775 |
| 1767 | 2146.794 |
| 1768 | 2128.321 |
| 1769 | 2107.323 |
| 1770 | 2082.705 |
| 1771 | 2054.169 |
| 1772 | 2022.432 |
| 1773 | 1987.409 |
| 1774 | 1953.169 |
| 1775 | 1916.306 |
| 1776 | 1882.168 |
| 1777 | 1850.092 |
| 1778 | 1815.303 |
| 1779 | 1780.106 |
| 1780 | 1743.679 |
| 1781 | 1708.342 |
| 1782 | 1675.594 |
| 1783 | 1643.2 |
| 1784 | 1609.473 |
| 1785 | 1578.95 |
| 1786 | 1550.513 |
| 1787 | 1521.389 |
| 1788 | 1492.386 |
| 1789 | 1465.476 |
| 1790 | 1437.492 |
| 1791 | 1414.165 |
| 1792 | 1394.104 |
| 1793 | 1378.887 |
| 1794 | 1367.069 |
| 1795 | 1357.901 |
| 1796 | 1347.722 |
| 1797 | 1333.101 |
| 1798 | 1316.946 |
| 1799 | 1300.436 |
| 1800 | 1284.637 |
| 1801 | 1265.563 |
| 1802 | 1247.386 |
| 1803 | 1230.726 |
| 1804 | 1215.101 |
| 1805 | 1199.397 |
| 1806 | 1184.385 |
| 1807 | 1171.79 |
| 1808 | 1160.916 |
| 1809 | 1150.696 |
| 1810 | 1142.228 |
| 1811 | 1134.324 |
| 1812 | 1127.472 |
| 1813 | 1122.1 |
| 1814 | 1117.234 |
| 1815 | 1114.082 |
| 1816 | 1111.632 |
| 1817 | 1109.502 |
| 1818 | 1107.11 |
| 1819 | 1104.427 |
| 1820 | 1102.251 |
| 1821 | 1099.366 |
| 1822 | 1096.196 |
| 1823 | 1094.269 |
| 1824 | 1092.607 |
| 1825 | 1090.51 |
| 1826 | 1087.51 |
| 1827 | 1084.375 |
| 1828 | 1079.347 |
| 1829 | 1069.767 |
| 1830 | 1054.496 |
| 1831 | 1036.609 |
| 1832 | 1021.503 |
| 1833 | 1007.847 |
| 1834 | 994.007 |
| 1835 | 981.748 |
| 1836 | 972.131 |
| 1837 | 964.942 |
| 1838 | 962.443 |
| 1839 | 961.997 |
| 1840 | 964.094 |
| 1841 | 968.13 |
| 1842 | 971.904 |
| 1843 | 975.465 |
| 1844 | 977.827 |
| 1845 | 979.208 |
| 1846 | 976.309 |
| 1847 | 971.703 |
| 1848 | 965.574 |
| 1849 | 960.803 |
| 1850 | 957.903 |
| 1851 | 951.515 |
| 1852 | 942.653 |
| 1853 | 930.497 |
| 1854 | 919.343 |
| 1855 | 907.355 |
| 1856 | 897.826 |
| 1857 | 893.927 |
| 1858 | 893.451 |
| 1859 | 895.264 |
| 1860 | 898.709 |
| 1861 | 904.875 |
| 1862 | 908.817 |
| 1863 | 910.973 |
| 1864 | 911.82 |
| 1865 | 914.576 |
| 1866 | 917.212 |
| 1867 | 919.536 |
| 1868 | 921.471 |
| 1869 | 923.583 |
| 1870 | 925.932 |
| 1871 | 926.572 |
| 1872 | 923.05 |
| 1873 | 914.115 |
| 1874 | 902.69 |
| 1875 | 890.683 |
| 1876 | 877.663 |
| 1877 | 865.119 |
| 1878 | 852.452 |
| 1879 | 840.259 |
| 1880 | 829.627 |
| 1881 | 820.446 |
| 1882 | 813.692 |
| 1883 | 807.129 |
| 1884 | 799.659 |
| 1885 | 791.388 |
| 1886 | 780.584 |
| 1887 | 768.419 |
| 1888 | 756.684 |
| 1889 | 747.829 |
| 1890 | 742.692 |
| 1891 | 737.155 |
| 1892 | 729.974 |
| 1893 | 724.482 |
| 1894 | 723.13 |
| 1895 | 722.403 |
| 1896 | 722.072 |
| 1897 | 722.072 |
| 1898 | 722.072 |
| 1899 | 722.072 |
| 1900 | 722.072 |
| 1901 | 722.072 |
| 1902 | 721.962 |
| 1903 | 721.853 |
| 1904 | 721.742 |
| 1905 | 721.742 |
| 1906 | 721.147 |
| 1907 | 718.223 |
| 1908 | 705.656 |
| 1909 | 695.322 |
| 1910 | 684.546 |
| 1911 | 673.378 |
| 1912 | 664.532 |
| 1913 | 657.676 |
| 1914 | 649.832 |
| 1915 | 642.442 |
| 1916 | 635.697 |
| 1917 | 627.863 |
| 1918 | 616.448 |
| 1919 | 605.485 |
| 1920 | 595.073 |
| 1921 | 587.242 |
| 1922 | 580.748 |
| 1923 | 576.713 |
| 1924 | 574.706 |
| 1925 | 573.145 |
| 1926 | 571.575 |
| 1927 | 570.814 |
| 1928 | 569.526 |
| 1929 | 567.751 |
| 1930 | 566.376 |
| 1931 | 565.457 |
| 1932 | 565.061 |
| 1933 | 565.323 |
| 1934 | 564.793 |
| 1935 | 562.783 |
| 1936 | 562.565 |
| 1937 | 562.783 |
| 1938 | 562.783 |
| 1939 | 562.783 |
| 1940 | 562.893 |
| 1941 | 562.893 |
| 1942 | 563.002 |
| 1943 | 563.11 |
| 1944 | 563.11 |
| 1945 | 563.002 |
| 1946 | 563.002 |
| 1947 | 563.002 |
| 1948 | 562.893 |
| 1949 | 562.893 |
| 1950 | 562.893 |
| 1951 | 562.893 |
| 1952 | 562.893 |
| 1953 | 562.893 |
| 1954 | 562.893 |
| 1955 | 562.783 |
| 1956 | 562.783 |
| 1957 | 563.002 |
| 1958 | 562.826 |
| 1959 | 562.893 |
| 1960 | 563.724 |
| 1961 | 564.269 |
| 1962 | 564.269 |
| 1963 | 564.051 |
| 1964 | 564.051 |
| 1965 | 564.16 |
| 1966 | 564.269 |
| 1967 | 564.269 |
| 1968 | 564.269 |
| 1969 | 564.269 |
| 1970 | 564.269 |
| 1971 | 564.16 |
| 1972 | 564.16 |
| 1973 | 564.16 |
| 1974 | 564.269 |
| 1975 | 564.902 |
| 1976 | 564.606 |
| 1977 | 564.732 |
| 1978 | 564.897 |
| 1979 | 565.181 |
| 1980 | 566.053 |
| 1981 | 566.252 |
| 1982 | 565.803 |
| 1983 | 565.681 |
| 1984 | 565.649 |
| 1985 | 565.783 |
| 1986 | 565.829 |
| 1987 | 565.695 |
| 1988 | 566.097 |
| 1989 | 566.097 |
| 1990 | 565.968 |
| 1991 | 566.046 |
| 1992 | 566.046 |
| 1993 | 566.135 |
| 1994 | 566.111 |
| 1995 | 565.425 |
| 1996 | 565.425 |
| 1997 | 564.295 |
| 1998 | 563.062 |
| 1999 | 560.15 |
| 2000 | 557.575 |
| 2001 | 557.575 |
| 2002 | 556.233 |
| 2003 | 553.215 |
| 2004 | 551.761 |
| 2005 | 550.085 |
| 2006 | 547.513 |
| 2007 | 543.268 |
| 2008 | 540.477 |
| 2009 | 537.912 |
| 2010 | 536.251 |
| 2011 | 535.038 |
| 2012 | 533.942 |
| 2013 | 534.318 |
| 2014 | 535.238 |
| 2015 | 535.012 |
| 2016 | 534.9 |
| 2017 | 534.9 |
| 2018 | 534.788 |
| 2019 | 534.788 |
| 2020 | 534.9 |
| 2021 | 534.788 |
| 2022 | 534.9 |
| 2023 | 535.012 |
| 2024 | 535.012 |
| 2025 | 534.358 |
| 2026 | 534.29 |
| 2027 | 534.341 |
| 2028 | 534.362 |
| 2029 | 534.582 |
| 2030 | 534.608 |
| 2031 | 534.991 |
| 2032 | 535.762 |
| 2033 | 536.15 |
| 2034 | 536.49 |
| 2035 | 536.327 |
| 2036 | 536.327 |
| 2037 | 536.67 |
| 2038 | 535.409 |
| 2039 | 534.06 |
| 2040 | 531.804 |
| 2041 | 528.8 |
| 2042 | 525.402 |
| 2043 | 523.158 |
| 2044 | 521.03 |
| 2045 | 518.798 |
| 2046 | 516.681 |
| 2047 | 514.452 |
| 2048 | 512.914 |
| 2049 | 510.832 |
| 2050 | 508.469 |
| 2051 | 506.428 |
| 2052 | 504.676 |
| 2053 | 503.05 |
| 2054 | 501.952 |
| 2055 | 500.705 |
| 2056 | 499.532 |
| 2057 | 498.192 |
| 2058 | 496.241 |
| 2059 | 493.637 |
| 2060 | 491.151 |
| 2061 | 488.295 |
| 2062 | 485.672 |
| 2063 | 482.658 |
| 2064 | 479.723 |
| 2065 | 477.332 |
| 2066 | 476.213 |
| 2067 | 473.478 |
| 2068 | 472.244 |
| 2069 | 470.975 |
| 2070 | 469.707 |
| 2071 | 466.743 |
| 2072 | 464.012 |
| 2073 | 461.557 |
| 2074 | 460.215 |
| 2075 | 457.651 |
| 2076 | 455.126 |
| 2077 | 453.788 |
| 2078 | 452.338 |
| 2079 | 451.066 |
| 2080 | 451.066 |
| 2081 | 449.848 |
| 2082 | 447.012 |
| 2083 | 445.565 |
| 2084 | 444.064 |
| 2085 | 442.097 |
| 2086 | 442.425 |
| 2087 | 443.249 |
| 2088 | 443.964 |
| 2089 | 444.196 |
| 2090 | 444.499 |
| 2091 | 444.435 |
| 2092 | 444.087 |
| 2093 | 444.087 |
| 2094 | 443.701 |
| 2095 | 443.815 |
| 2096 | 443.815 |
| 2097 | 443.701 |
| 2098 | 444.008 |
| 2099 | 445.592 |
| 2100 | 445.904 |
| 2101 | 445.754 |
| 2102 | 445.258 |
| 2103 | 445.258 |
| 2104 | 444.881 |
| 2105 | 444.258 |
| 2106 | 444.258 |
| 2107 | 443.306 |
| 2108 | 442.237 |
| 2109 | 442.237 |
| 2110 | 441.055 |
| 2111 | 440.36 |
| 2112 | 439.572 |
| 2113 | 439.572 |
| 2114 | 437.539 |
| 2115 | 435.383 |
| 2116 | 434.296 |
| 2117 | 434.036 |
| 2118 | 434.036 |
| 2119 | 433.689 |
| 2120 | 432.968 |
| 2121 | 432.157 |
| 2122 | 431.321 |
| 2123 | 430.305 |
| 2124 | 427.524 |
| 2125 | 425.785 |
| 2126 | 424.139 |
| 2127 | 424.139 |
| 2128 | 420.872 |
| 2129 | 418.071 |
| 2130 | 416.776 |
| 2131 | 415.242 |
| 2132 | 414.068 |
| 2133 | 414.068 |
| 2134 | 412.895 |
| 2135 | 411.956 |
| 2136 | 410.901 |
| 2137 | 408.452 |
| 2138 | 405.782 |
| 2139 | 403.111 |
| 2140 | 403.111 |
| 2141 | 402.066 |
| 2142 | 401.259 |
| 2143 | 401.259 |
| 2144 | 400.684 |
| 2145 | 400.226 |
| 2146 | 400.226 |
| 2147 | 399.887 |
| 2148 | 399.091 |
| 2149 | 398.176 |
| 2150 | 398.176 |
| 2151 | 397.148 |
| 2152 | 396.122 |
| 2153 | 395.096 |
| 2154 | 394.074 |
| 2155 | 393.053 |
| 2156 | 392.266 |
| 2157 | 391.958 |
| 2158 | 391.958 |
| 2159 | 391.842 |
| 2160 | 391.842 |
| 2161 | 391.842 |
| 2162 | 391.726 |
| 2163 | 391.726 |
| 2164 | 391.726 |
| 2165 | 391.726 |
| 2166 | 391.726 |
| 2167 | 391.726 |
| 2168 | 391.726 |
| 2169 | 391.726 |
| 2170 | 391.726 |
| 2171 | 391.726 |
| 2172 | 391.726 |
| 2173 | 391.726 |
| 2174 | 391.726 |
| 2175 | 391.726 |
| 2176 | 391.726 |
| 2177 | 391.726 |
| 2178 | 391.726 |
| 2179 | 391.726 |
| 2180 | 391.726 |
| 2181 | 391.726 |
| 2182 | 391.61 |
| 2183 | 391.61 |
| 2184 | 391.61 |
| 2185 | 391.61 |
| 2186 | 391.61 |
| 2187 | 391.61 |
| 2188 | 391.61 |
| 2189 | 391.61 |
| 2190 | 391.61 |
| 2191 | 391.61 |
| 2192 | 391.61 |
| 2193 | 391.61 |
| 2194 | 391.61 |
| 2195 | 391.61 |
| 2196 | 391.61 |
| 2197 | 391.61 |
| 2198 | 391.726 |
| 2199 | 391.726 |
| 2200 | 391.726 |
| 2201 | 391.726 |
| 2202 | 391.726 |
| 2203 | 391.726 |
| 2204 | 391.61 |
| 2205 | 391.61 |
| 2206 | 391.61 |
| 2207 | 391.61 |
| 2208 | 391.61 |
| 2209 | 391.61 |
| 2210 | 391.61 |
| 2211 | 391.494 |
| 2212 | 391.494 |
| 2213 | 391.494 |
| 2214 | 391.494 |
| 2215 | 391.494 |
| 2216 | 391.494 |
| 2217 | 391.494 |
| 2218 | 391.494 |
| 2219 | 391.378 |
| 2220 | 391.378 |
| 2221 | 391.378 |
| 2222 | 391.378 |
| 2223 | 391.263 |
| 2224 | 391.263 |
| 2225 | 391.263 |
| 2226 | 391.263 |
| 2227 | 391.378 |
| 2228 | 391.378 |
| 2229 | 391.378 |
| 2230 | 391.378 |
| 2231 | 391.378 |
| 2232 | 391.378 |
| 2233 | 391.378 |
| 2234 | 391.378 |
| 2235 | 391.378 |
| 2236 | 391.378 |
| 2237 | 391.378 |
| 2238 | 391.378 |
| 2239 | 391.378 |
| 2240 | 391.378 |
| 2241 | 391.378 |
| 2242 | 391.378 |
| 2243 | 391.378 |
| 2244 | 391.378 |
| 2245 | 391.378 |
| 2246 | 391.378 |
| 2247 | 391.339 |
| 2248 | 391.339 |
| 2249 | 391.339 |
| 2250 | 391.339 |
| 2251 | 391.339 |
| 2252 | 391.339 |
| 2253 | 391.339 |
| 2254 | 391.339 |
| 2255 | 391.339 |
| 2256 | 391.339 |
| 2257 | 391.339 |
| 2258 | 391.339 |
| 2259 | 391.339 |
| 2260 | 391.339 |
| 2261 | 391.339 |
| 2262 | 391.339 |
| 2263 | 391.339 |
| 2264 | 391.339 |
| 2265 | 391.339 |
| 2266 | 391.339 |
| 2267 | 391.339 |
| 2268 | 391.339 |
| 2269 | 391.339 |
| 2270 | 391.339 |
| 2271 | 391.224 |
| 2272 | 391.224 |
| 2273 | 391.224 |
| 2274 | 391.224 |
| 2275 | 391.224 |
| 2276 | 391.224 |
| 2277 | 391.224 |
| 2278 | 391.339 |
| 2279 | 391.803 |
| 2280 | 393.031 |
| 2281 | 393.031 |
| 2282 | 393.706 |
| 2283 | 394.17 |
| 2284 | 394.17 |
| 2285 | 394.73 |
| 2286 | 396.554 |
| 2287 | 397.237 |
| 2288 | 397.677 |
| 2289 | 397.677 |
| 2290 | 398.018 |
| 2291 | 398.477 |
| 2292 | 398.477 |
| 2293 | 398.822 |
| 2294 | 399.285 |
| 2295 | 399.982 |
| 2296 | 400.914 |
| 2297 | 402.078 |
| 2298 | 403.361 |
| 2299 | 406.045 |
| 2300 | 407.32 |
| 2301 | 407.32 |
| 2302 | 408.723 |
| 2303 | 410.345 |
| 2304 | 411.633 |
| 2305 | 411.633 |
| 2306 | 413.025 |
| 2307 | 414.431 |
| 2308 | 415.706 |
| 2309 | 418.418 |
| 2310 | 421.011 |
| 2311 | 424.164 |
| 2312 | 426.945 |
| 2313 | 429.404 |
| 2314 | 429.404 |
| 2315 | 430.705 |
| 2316 | 432.21 |
| 2317 | 432.21 |
| 2318 | 435.035 |
| 2319 | 436.225 |
| 2320 | 437.531 |
| 2321 | 438.574 |
| 2322 | 438.574 |
| 2323 | 439.42 |
| 2324 | 440.461 |
| 2325 | 440.461 |
| 2326 | 441.772 |
| 2327 | 442.929 |
| 2328 | 443.738 |
| 2329 | 443.738 |
| 2330 | 444.746 |
| 2331 | 445.788 |
| 2332 | 445.788 |
| 2333 | 447.213 |
| 2334 | 448.524 |
| 2335 | 448.524 |
| 2336 | 451.225 |
| 2337 | 453.813 |
| 2338 | 456.697 |
| 2339 | 458.87 |
| 2340 | 459.913 |
| 2341 | 461.185 |
| 2342 | 462.575 |
| 2343 | 462.575 |
| 2344 | 463.964 |
| 2345 | 465.352 |
| 2346 | 466.972 |
| 2347 | 469.681 |
| 2348 | 469.681 |
| 2349 | 470.77 |
| 2350 | 471.746 |
| 2351 | 471.746 |
| 2352 | 472.671 |
| 2353 | 473.828 |
| 2354 | 473.828 |
| 2355 | 476.566 |
| 2356 | 478.123 |
| 2357 | 479.449 |
| 2358 | 480.722 |
| 2359 | 480.722 |
| 2360 | 482.049 |
| 2361 | 483.321 |
| 2362 | 484.766 |
| 2363 | 484.766 |
| 2364 | 486.094 |
| 2365 | 487.368 |
| 2366 | 487.368 |
| 2367 | 488.582 |
| 2368 | 489.661 |
| 2369 | 490.534 |
| 2370 | 491.243 |
| 2371 | 491.728 |
| 2372 | 492.907 |
| 2373 | 493.831 |
| 2374 | 494.767 |
| 2375 | 495.735 |
| 2376 | 496.817 |
| 2377 | 497.947 |
| 2378 | 498.484 |
| 2379 | 499.09 |
| 2380 | 500.114 |
| 2381 | 501.329 |
| 2382 | 501.908 |
| 2383 | 503.196 |
| 2384 | 504.558 |
| 2385 | 505.851 |
| 2386 | 507.856 |
| 2387 | 508.679 |
| 2388 | 510.741 |
| 2389 | 512.737 |
| 2390 | 513.825 |
| 2391 | 514.77 |
| 2392 | 515.602 |
| 2393 | 517.914 |
| 2394 | 519.319 |
| 2395 | 519.205 |
| 2396 | 520.041 |
| 2397 | 522.018 |
| 2398 | 523.198 |
| 2399 | 526.135 |
| 2400 | 527.388 |
| 2401 | 528.913 |
| 2402 | 528.913 |
| 2403 | 530.21 |
| 2404 | 531.121 |
| 2405 | 531.121 |
| 2406 | 531.349 |
| 2407 | 531.349 |
| 2408 | 531.349 |
| 2409 | 531.349 |
| 2410 | 531.349 |
| 2411 | 531.349 |
| 2412 | 531.349 |
| 2413 | 531.349 |
| 2414 | 531.463 |
| 2415 | 531.463 |
| 2416 | 531.463 |
| 2417 | 531.463 |
| 2418 | 531.463 |
| 2419 | 531.463 |
| 2420 | 531.463 |
| 2421 | 531.463 |
| 2422 | 531.463 |
| 2423 | 532.078 |
| 2424 | 532.988 |
| 2425 | 534.288 |
| 2426 | 534.288 |
| 2427 | 535.587 |
| 2428 | 537.815 |
| 2429 | 538.89 |
| 2430 | 538.89 |
| 2431 | 540.191 |
| 2432 | 541.381 |
| 2433 | 542.686 |
| 2434 | 545.183 |
| 2435 | 547.087 |
| 2436 | 547.087 |
| 2437 | 549.652 |
| 2438 | 551.934 |
| 2439 | 554.262 |
| 2440 | 556.552 |
| 2441 | 558.126 |
| 2442 | 559.918 |
| 2443 | 560.528 |
| 2444 | 560.917 |
| 2445 | 561.947 |
| 2446 | 563.34 |
| 2447 | 564.508 |
| 2448 | 565.149 |
| 2449 | 565.783 |
| 2450 | 566.313 |
| 2451 | 566.973 |
| 2452 | 568.313 |
| 2453 | 569.988 |
| 2454 | 572.334 |
| 2455 | 572.223 |
| 2456 | 572.113 |
| 2457 | 572.113 |
| 2458 | 572.113 |
| 2459 | 572.001 |
| 2460 | 572.001 |
| 2461 | 572.001 |
| 2462 | 571.328 |
| 2463 | 571.328 |
| 2464 | 571.328 |
| 2465 | 571.665 |
| 2466 | 571.328 |
| 2467 | 571.665 |
| 2468 | 571.44 |
| 2469 | 571.328 |
| 2470 | 571.105 |
| 2471 | 571.216 |
| 2472 | 571.216 |
| 2473 | 571.216 |
| 2474 | 571.44 |
| 2475 | 571.328 |
| 2476 | 571.44 |
| 2477 | 571.665 |
| 2478 | 570.776 |
| 2479 | 568.994 |
| 2480 | 567.45 |
| 2481 | 566.024 |
| 2482 | 565.378 |
| 2483 | 565.098 |
| 2484 | 564.919 |
| 2485 | 564.785 |
| 2486 | 564.874 |
| 2487 | 564.166 |
| 2488 | 563.966 |
| 2489 | 563.32 |
| 2490 | 562.823 |
| 2491 | 562.319 |
| 2492 | 561.334 |
| 2493 | 560.666 |
| 2494 | 560.14 |
| 2495 | 560.14 |
| 2496 | 559.812 |
| 2497 | 559.485 |
| 2498 | 559.593 |
| 2499 | 559.485 |
| 2500 | 559.485 |
| 2501 | 559.593 |
| 2502 | 559.593 |
| 2503 | 559.529 |
| 2504 | 559.201 |
| 2505 | 559.201 |
| 2506 | 559.201 |
| 2507 | 559.31 |
| 2508 | 559.419 |
| 2509 | 559.812 |
| 2510 | 559.922 |
| 2511 | 559.922 |
| 2512 | 559.922 |
| 2513 | 11.875 |
| 2514 | 7.26 |
| 2515 | 7.26 |
| 2516 | 12.55 |
| 2517 | 24.85 |
| 2518 | 24.85 |
| 2519 | 24.85 |
| 2520 | 23.685 |
| 2521 | 23.517 |
| 2522 | 22.2 |
| 2523 | 22.2 |
| 2524 | 19.002 |
| 2525 | 19.002 |
| 2526 | 19.002 |
| 2527 | 16.69 |
| 2528 | 10.369 |
| 2529 | 10.369 |
| 2530 | 7.805 |
| 2531 | 5.57 |
| 2532 | 4.784 |
| 2533 | 4.485 |
| 2534 | 4.485 |
| 2535 | 4.599 |
| 2536 | 4.712 |
| 2537 | 4.712 |
| 2538 | 4.867 |
| 2539 | 4.826 |
| 2540 | 4.941 |
| 2541 | 4.941 |
| 2542 | 5.155 |
| 2543 | 5.045 |
| 2544 | 5.39 |
| 2545 | 5.39 |
| 2546 | 5.087 |
| 2547 | 4.788 |
| 2548 | 4.504 |
| 2549 | 4.504 |
| 2550 | 4.72 |
| 2551 | 4.828 |
| 2552 | 4.828 |
| 2553 | 5.055 |
| 2554 | 4.03 |
| 2555 | 4.03 |
| 2556 | 4.257 |
| 2557 | 4.599 |
| 2558 | 5.055 |
| 2559 | 5.055 |
| 2560 | 5.845 |
| 2561 | 6.086 |
| 2562 | 6.086 |
| 2563 | 6.374 |
| 2564 | 7.466 |
| 2565 | 7.466 |
| 2566 | 7.35 |
| 2567 | 7.38 |
| 2568 | 6.718 |
| 2569 | 6.718 |
| 2570 | 6.511 |
| 2571 | 7.26 |
| 2572 | 7.26 |
| 2573 | 5.741 |
| 2574 | 3.78 |
| 2575 | 3.877 |
| 2576 | 3.877 |
| 2577 | 4.577 |
| 2578 | 4.993 |
| 2579 | 4.993 |
| 2580 | 5.203 |
| 2581 | 5.309 |
| 2582 | 5.309 |
| 2583 | 5.416 |
| 2584 | 5.416 |
| 2585 | 5.17 |
| 2586 | 5.17 |
| 2587 | 5.284 |
| 2588 | 5.398 |
| 2589 | 5.398 |
| 2590 | 5.331 |
| 2591 | 5.331 |
| 2592 | 5.331 |
| 2593 | 5.563 |
| 2594 | 5.857 |
| 2595 | 5.857 |
| 2596 | 5.857 |
| 2597 | 5.857 |
| 2598 | 5.971 |
| 2599 | 5.971 |
| 2600 | 5.971 |
| 2601 | 5.971 |
| 2602 | 5.971 |
| 2603 | 5.971 |
| 2604 | 5.971 |
| 2605 | 6.086 |
| 2606 | 6.086 |
| 2607 | 6.086 |
| 2608 | 6.261 |
| 2609 | 6.261 |
| 2610 | 6.373 |
| 2611 | 6.373 |
| 2612 | 6.484 |
| 2613 | 6.484 |
| 2614 | 6.484 |
| 2615 | 6.484 |
| 2616 | 6.596 |
| 2617 | 6.596 |
| 2618 | 6.864 |
| 2619 | 6.864 |
| 2620 | 6.864 |
| 2621 | 6.864 |
| 2622 | 6.864 |
| 2623 | 6.864 |
| 2624 | 6.864 |
| 2625 | 6.864 |
| 2626 | 6.971 |
| 2627 | 6.971 |
| 2628 | 6.971 |
| 2629 | 7.079 |
| 2630 | 7.079 |
| 2631 | 7.079 |
| 2632 | 7.427 |
| 2633 | 7.53 |
| 2634 | 7.53 |
| 2635 | 7.634 |
| 2636 | 7.634 |
| 2637 | 7.634 |
| 2638 | 7.634 |
| 2639 | 7.634 |
| 2640 | 7.634 |
| 2641 | 7.634 |
| 2642 | 7.634 |
| 2643 | 7.634 |
| 2644 | 7.634 |
| 2645 | 7.634 |
| 2646 | 7.634 |
| 2647 | 7.634 |
| 2648 | 7.634 |
| 2649 | 7.634 |
| 2650 | 7.53 |
| 2651 | 7.53 |
| 2652 | 7.53 |
| 2653 | 7.53 |
| 2654 | 7.53 |
| 2655 | 7.53 |
| 2656 | 7.53 |
| 2657 | 7.53 |
| 2658 | 7.53 |
| 2659 | 7.53 |
| 2660 | 7.53 |
| 2661 | 7.427 |
| 2662 | 7.427 |
| 2663 | 7.53 |
| 2664 | 7.427 |
| 2665 | 7.427 |
| 2666 | 7.427 |
| 2667 | 7.427 |
| 2668 | 7.427 |
| 2669 | 7.427 |
| 2670 | 7.427 |
| 2671 | 7.427 |
| 2672 | 7.427 |
| 2673 | 7.427 |
| 2674 | 7.427 |
| 2675 | 7.427 |
| 2676 | 7.427 |
| 2677 | 7.323 |
| 2678 | 7.323 |
| 2679 | 7.323 |
| 2680 | 7.323 |
| 2681 | 7.323 |
| 2682 | 7.323 |
| 2683 | 7.323 |
| 2684 | 7.323 |
| 2685 | 7.323 |
| 2686 | 7.323 |
| 2687 | 7.323 |
| 2688 | 7.323 |
| 2689 | 7.323 |
| 2690 | 7.323 |
| 2691 | 7.323 |
| 2692 | 7.323 |
| 2693 | 7.221 |
| 2694 | 7.221 |
| 2695 | 7.221 |
| 2696 | 7.221 |
| 2697 | 7.221 |
| 2698 | 7.221 |
| 2699 | 7.221 |
| 2700 | 7.119 |
| 2701 | 7.119 |
| 2702 | 7.119 |
| 2703 | 7.119 |
| 2704 | 7.119 |
| 2705 | 7.119 |
| 2706 | 7.119 |
| 2707 | 7.119 |
| 2708 | 7.119 |
| 2709 | 7.119 |
| 2710 | 7.119 |
| 2711 | 7.119 |
| 2712 | 7.119 |
| 2713 | 7.119 |
| 2714 | 7.119 |
| 2715 | 7.119 |
| 2716 | 7.119 |
| 2717 | 7.119 |
| 2718 | 7.119 |
| 2719 | 7.119 |
| 2720 | 7.119 |
| 2721 | 7.119 |
| 2722 | 7.119 |
| 2723 | 7.119 |
| 2724 | 7.119 |
| 2725 | 7.119 |
| 2726 | 7.119 |
| 2727 | 7.119 |
| 2728 | 7.018 |
| 2729 | 7.018 |
| 2730 | 7.018 |
| 2731 | 7.018 |
| 2732 | 7.018 |
| 2733 | 7.018 |
| 2734 | 7.018 |
| 2735 | 7.018 |
| 2736 | 7.018 |
| 2737 | 7.018 |
| 2738 | 7.018 |
| 2739 | 7.018 |
| 2740 | 7.018 |
| 2741 | 7.018 |
| 2742 | 7.018 |
| 2743 | 7.018 |
| 2744 | 7.018 |
| 2745 | 7.018 |
| 2746 | 7.018 |
| 2747 | 7.018 |
| 2748 | 7.018 |
| 2749 | 7.018 |
| 2750 | 7.018 |
| 2751 | 7.018 |
| 2752 | 7.018 |
| 2753 | 7.018 |
| 2754 | 7.018 |
| 2755 | 7.018 |
| 2756 | 7.018 |
| 2757 | 7.018 |
| 2758 | 6.916 |
| 2759 | 6.916 |
| 2760 | 6.916 |
| 2761 | 7.018 |
| 2762 | 7.018 |
| 2763 | 7.018 |
| 2764 | 7.018 |
| 2765 | 7.018 |
| 2766 | 7.018 |
| 2767 | 7.018 |
| 2768 | 7.018 |
| 2769 | 6.916 |
| 2770 | 6.916 |
| 2771 | 6.916 |
| 2772 | 6.916 |
| 2773 | 6.916 |
| 2774 | 6.916 |
| 2775 | 6.916 |
| 2776 | 6.916 |
| 2777 | 6.916 |
| 2778 | 6.916 |
| 2779 | 6.916 |
| 2780 | 6.916 |
| 2781 | 6.916 |
| 2782 | 6.916 |
| 2783 | 6.916 |
| 2784 | 6.916 |
| 2785 | 6.916 |
| 2786 | 6.916 |
| 2787 | 6.916 |
| 2788 | 6.916 |
| 2789 | 6.916 |
| 2790 | 6.916 |
| 2791 | 6.916 |
| 2792 | 6.916 |
| 2793 | 6.916 |
| 2794 | 6.916 |
| 2795 | 6.916 |
| 2796 | 6.916 |
| 2797 | 6.916 |
| 2798 | 6.916 |
| 2799 | 6.916 |
| 2800 | 6.916 |
| 2801 | 6.916 |
| 2802 | 6.916 |
| 2803 | 6.916 |
| 2804 | 6.916 |
| 2805 | 6.916 |
| 2806 | 6.916 |
| 2807 | 6.916 |
| 2808 | 6.815 |
| 2809 | 6.815 |
| 2810 | 6.815 |
| 2811 | 6.815 |
| 2812 | 6.815 |
| 2813 | 6.815 |
| 2814 | 6.815 |
| 2815 | 6.815 |
| 2816 | 6.815 |
| 2817 | 6.815 |
| 2818 | 6.815 |
| 2819 | 6.716 |
| 2820 | 6.716 |
| 2821 | 6.716 |
| 2822 | 6.716 |
| 2823 | 6.716 |
| 2824 | 6.716 |
| 2825 | 6.716 |
| 2826 | 6.716 |
| 2827 | 6.716 |
| 2828 | 6.716 |
| 2829 | 6.716 |
| 2830 | 6.716 |
| 2831 | 6.716 |
| 2832 | 6.716 |
| 2833 | 6.716 |
| 2834 | 6.716 |
| 2835 | 6.616 |
| 2836 | 6.616 |
| 2837 | 6.616 |
| 2838 | 6.616 |
| 2839 | 6.616 |
| 2840 | 6.616 |
| 2841 | 6.616 |
| 2842 | 6.616 |
| 2843 | 6.616 |
| 2844 | 6.616 |
| 2845 | 6.616 |
| 2846 | 6.616 |
| 2847 | 6.616 |
| 2848 | 6.616 |
| 2849 | 6.616 |
| 2850 | 6.616 |
| 2851 | 6.616 |
| 2852 | 6.616 |
| 2853 | 6.616 |
| 2854 | 6.616 |
| 2855 | 6.616 |
| 2856 | 6.516 |
| 2857 | 6.516 |
| 2858 | 6.516 |
| 2859 | 6.516 |
| 2860 | 6.516 |
| 2861 | 6.516 |
| 2862 | 6.516 |
| 2863 | 6.516 |
| 2864 | 6.516 |
| 2865 | 6.516 |
| 2866 | 6.516 |
| 2867 | 6.516 |
| 2868 | 6.516 |
| 2869 | 6.516 |
| 2870 | 6.516 |
| 2871 | 6.516 |
| 2872 | 6.516 |
| 2873 | 6.516 |
| 2874 | 6.516 |
| 2875 | 6.516 |
| 2876 | 6.417 |
| 2877 | 6.417 |
| 2878 | 6.417 |
| 2879 | 6.417 |
| 2880 | 6.417 |
| 2881 | 6.417 |
| 2882 | 6.417 |
| 2883 | 6.417 |
| 2884 | 6.417 |
| 2885 | 6.417 |
| 2886 | 6.417 |
| 2887 | 6.417 |
| 2888 | 6.417 |
| 2889 | 6.417 |
| 2890 | 6.32 |
| 2891 | 6.32 |
| 2892 | 6.32 |
| 2893 | 6.32 |
| 2894 | 6.32 |
| 2895 | 6.32 |
| 2896 | 6.32 |
| 2897 | 6.223 |
| 2898 | 6.223 |
| 2899 | 6.223 |
| 2900 | 6.223 |
| 2901 | 6.223 |
| 2902 | 6.223 |
| 2903 | 6.223 |
| 2904 | 6.126 |
| 2905 | 6.126 |
| 2906 | 6.126 |
| 2907 | 6.126 |
| 2908 | 6.126 |
| 2909 | 6.126 |
| 2910 | 6.126 |
| 2911 | 6.029 |
| 2912 | 6.029 |
| 2913 | 6.029 |
| 2914 | 6.029 |
| 2915 | 6.029 |
| 2916 | 5.934 |
| 2917 | 5.934 |
| 2918 | 5.934 |
| 2919 | 5.934 |
| 2920 | 5.839 |
| 2921 | 5.745 |
| 2922 | 5.745 |
| 2923 | 5.087 |
| 2924 | 4.887 |
| 2925 | 4.887 |
| 2926 | 4.986 |
| 2927 | 4.788 |
| 2928 | 5.288 |
| 2929 | 5.288 |
| 2930 | 5.288 |
| 2931 | 4.69 |
| 2932 | 4.69 |
| 2933 | 4.69 |
| 2934 | 4.499 |
| 2935 | 4.499 |
| 2936 | 4.404 |
| 2937 | 4.217 |
| 2938 | 4.125 |
| 2939 | 4.125 |
| 2940 | 4.034 |
| 2941 | 3.857 |
| 2942 | 3.857 |
| 2943 | 3.259 |
| 2944 | 3.259 |
| 2945 | 3.259 |
| 2946 | 3.259 |
| 2947 | 3.16 |
| 2948 | 3.16 |
| 2949 | 3.16 |
| 2950 | 3.16 |
| 2951 | 3.16 |
| 2952 | 3.16 |
| 2953 | 3.16 |
| 2954 | 3.16 |
| 2955 | 3.16 |
| 2956 | 3.16 |
| 2957 | 3.16 |
| 2958 | 3.16 |
| 2959 | 3.16 |
| 2960 | 3.16 |
| 2961 | 3.063 |
| 2962 | 3.063 |
| 2963 | 3.063 |
| 2964 | 3.063 |
| 2965 | 3.063 |
| 2966 | 3.063 |
| 2967 | 3.063 |
| 2968 | 3.063 |
| 2969 | 3.063 |
| 2970 | 3.063 |
| 2971 | 3.063 |
| 2972 | 3.063 |
| 2973 | 3.063 |
| 2974 | 3.063 |
| 2975 | 3.063 |
| 2976 | 3.063 |
| 2977 | 2.967 |
| 2978 | 2.967 |
| 2979 | 2.967 |
| 2980 | 2.967 |
| 2981 | 2.967 |
| 2982 | 2.967 |
| 2983 | 2.967 |
| 2984 | 2.967 |
| 2985 | 2.967 |
| 2986 | 2.967 |
| 2987 | 2.967 |
| 2988 | 2.967 |
| 2989 | 2.967 |
| 2990 | 2.873 |
| 2991 | 2.873 |
| 2992 | 2.873 |
| 2993 | 2.873 |
| 2994 | 2.873 |
| 2995 | 2.873 |
| 2996 | 2.873 |
| 2997 | 2.873 |
| 2998 | 2.873 |
| 2999 | 2.873 |
| 3000 | 2.873 |
| 3001 | 2.78 |
| 3002 | 2.78 |
| 3003 | 2.78 |
| 3004 | 2.78 |
| 3005 | 2.78 |
| 3006 | 2.78 |
| 3007 | 2.78 |
| 3008 | 2.78 |
| 3009 | 2.78 |
| 3010 | 2.78 |
| 3011 | 2.69 |
| 3012 | 2.69 |
| 3013 | 2.69 |
| 3014 | 2.69 |
| 3015 | 2.69 |
| 3016 | 2.69 |
| 3017 | 2.69 |
| 3018 | 2.69 |
| 3019 | 2.69 |
| 3020 | 2.69 |
| 3021 | 2.69 |
| 3022 | 2.69 |
| 3023 | 2.69 |
| 3024 | 2.601 |
| 3025 | 2.601 |
| 3026 | 2.601 |
| 3027 | 2.601 |
| 3028 | 2.601 |
| 3029 | 2.601 |
| 3030 | 2.601 |
| 3031 | 2.601 |
| 3032 | 2.601 |
| 3033 | 2.601 |
| 3034 | 2.601 |
| 3035 | 2.514 |
| 3036 | 2.514 |
| 3037 | 2.514 |
| 3038 | 2.514 |
| 3039 | 2.514 |
| 3040 | 2.514 |
| 3041 | 2.514 |
| 3042 | 2.514 |
| 3043 | 2.514 |
| 3044 | 2.514 |
| 3045 | 2.429 |
| 3046 | 2.429 |
| 3047 | 2.429 |
| 3048 | 2.429 |
| 3049 | 2.429 |
| 3050 | 2.429 |
| 3051 | 2.429 |
| 3052 | 2.429 |
| 3053 | 2.429 |
| 3054 | 2.429 |
| 3055 | 2.429 |
| 3056 | 2.348 |
| 3057 | 2.348 |
| 3058 | 2.348 |
| 3059 | 2.348 |
| 3060 | 2.348 |
| 3061 | 2.348 |
| 3062 | 2.348 |
| 3063 | 2.348 |
| 3064 | 2.348 |
| 3065 | 2.348 |
| 3066 | 2.348 |
| 3067 | 2.348 |
| 3068 | 2.348 |
| 3069 | 2.269 |
| 3070 | 2.269 |
| 3071 | 2.269 |
| 3072 | 2.269 |
| 3073 | 2.269 |
| 3074 | 2.269 |
| 3075 | 2.269 |
| 3076 | 2.269 |
| 3077 | 2.269 |
| 3078 | 2.269 |
| 3079 | 2.269 |
| 3080 | 2.269 |
| 3081 | 2.269 |
| 3082 | 2.269 |
| 3083 | 2.194 |
| 3084 | 2.194 |
| 3085 | 2.194 |
| 3086 | 2.194 |
| 3087 | 2.194 |
| 3088 | 2.194 |
| 3089 | 2.194 |
| 3090 | 2.194 |
| 3091 | 2.194 |
| 3092 | 2.194 |
| 3093 | 2.194 |
| 3094 | 2.194 |
| 3095 | 2.194 |
| 3096 | 2.194 |
| 3097 | 2.194 |
| 3098 | 2.194 |
| 3099 | 2.194 |
| 3100 | 2.194 |
| 3101 | 2.194 |
| 3102 | 2.123 |
| 3103 | 2.123 |
| 3104 | 2.123 |
| 3105 | 2.123 |
| 3106 | 2.123 |
| 3107 | 2.123 |
| 3108 | 2.123 |
| 3109 | 2.123 |
| 3110 | 2.123 |
| 3111 | 2.123 |
| 3112 | 2.123 |
| 3113 | 2.123 |
| 3114 | 2.123 |
| 3115 | 2.123 |
| 3116 | 2.123 |
| 3117 | 2.123 |
| 3118 | 2.123 |
| 3119 | 2.123 |
| 3120 | 2.123 |
| 3121 | 1.532 |
| 3122 | 1.532 |
| 3123 | 1.437 |
| 3124 | 1.437 |
| 3125 | 1.437 |
| 3126 | 1.437 |
| 3127 | 1.437 |
| 3128 | 1.437 |
| 3129 | 1.437 |
| 3130 | 1.437 |
| 3131 | 1.437 |
| 3132 | 1.437 |
| 3133 | 1.437 |
| 3134 | 1.437 |
| 3135 | 1.437 |
| 3136 | 1.437 |
| 3137 | 1.437 |
| 3138 | 1.437 |
| 3139 | 1.437 |
| 3140 | 1.437 |
| 3141 | 1.437 |
| 3142 | 1.437 |
| 3143 | 1.437 |
| 3144 | 1.437 |
| 3145 | 1.437 |
| 3146 | 1.437 |
| 3147 | 1.437 |
| 3148 | 1.437 |
| 3149 | 1.437 |
| 3150 | 1.437 |
| 3151 | 1.437 |
| 3152 | 1.437 |
| 3153 | 1.437 |
| 3154 | 1.437 |
| 3155 | 1.437 |
| 3156 | 1.437 |
| 3157 | 1.437 |
| 3158 | 1.345 |
| 3159 | 1.345 |
| 3160 | 1.345 |
| 3161 | 1.345 |
| 3162 | 1.345 |
| 3163 | 1.345 |
| 3164 | 1.345 |
| 3165 | 1.345 |
| 3166 | 1.345 |
| 3167 | 1.345 |
| 3168 | 1.345 |
| 3169 | 1.345 |
| 3170 | 1.345 |
| 3171 | 1.345 |
| 3172 | 1.345 |
| 3173 | 1.345 |
| 3174 | 1.345 |
| 3175 | 1.345 |
| 3176 | 1.345 |
| 3177 | 1.345 |
| 3178 | 1.345 |
| 3179 | 1.345 |
| 3180 | 1.345 |
| 3181 | 1.345 |
| 3182 | 1.345 |
| 3183 | 1.345 |
| 3184 | 1.345 |
| 3185 | 1.345 |
| 3186 | 1.345 |
| 3187 | 1.345 |
| 3188 | 1.345 |
| 3189 | 1.345 |
| 3190 | 1.345 |
| 3191 | 1.345 |
| 3192 | 1.345 |
| 3193 | 1.345 |
| 3194 | 1.345 |
| 3195 | 1.345 |
| 3196 | 1.345 |
| 3197 | 1.345 |
| 3198 | 1.345 |
| 3199 | 1.345 |
| 3200 | 1.345 |
| 3201 | 1.345 |
| 3202 | 1.345 |
| 3203 | 1.345 |
| 3204 | 1.345 |
| 3205 | 1.345 |
| 3206 | 1.345 |
| 3207 | 1.345 |
| 3208 | 1.345 |
| 3209 | 1.345 |
| 3210 | 1.345 |
| 3211 | 1.345 |
| 3212 | 1.345 |
| 3213 | 1.345 |
| 3214 | 1.345 |
| 3215 | 1.345 |
| 3216 | 1.345 |
| 3217 | 1.345 |
| 3218 | 1.345 |
| 3219 | 1.345 |
| 3220 | 1.345 |
| 3221 | 1.345 |
| 3222 | 1.345 |
| 3223 | 1.345 |
| 3224 | 1.345 |
| 3225 | 1.345 |
| 3226 | 1.345 |
| 3227 | 1.345 |
| 3228 | 1.345 |
| 3229 | 1.345 |
| 3230 | 1.345 |
| 3231 | 1.345 |
| 3232 | 1.345 |
| 3233 | 1.345 |
| 3234 | 1.345 |
| 3235 | 1.345 |
| 3236 | 1.345 |
| 3237 | 1.345 |
| 3238 | 1.345 |
| 3239 | 1.345 |
| 3240 | 1.345 |
| 3241 | 1.257 |
| 3242 | 1.257 |
| 3243 | 1.257 |
| 3244 | 1.257 |
| 3245 | 1.257 |
| 3246 | 1.257 |
| 3247 | 1.257 |
| 3248 | 1.257 |
| 3249 | 1.257 |
| 3250 | 1.257 |
| 3251 | 1.257 |
| 3252 | 1.257 |
| 3253 | 1.257 |
| 3254 | 1.257 |
| 3255 | 1.257 |
| 3256 | 1.257 |
| 3257 | 1.257 |
| 3258 | 1.257 |
| 3259 | 1.257 |
| 3260 | 1.257 |
| 3261 | 1.257 |
| 3262 | 1.257 |
| 3263 | 1.174 |
| 3264 | 1.174 |
| 3265 | 1.174 |
| 3266 | 1.174 |
| 3267 | 1.174 |
| 3268 | 1.174 |
| 3269 | 1.174 |
| 3270 | 1.174 |
| 3271 | 1.174 |
| 3272 | 1.174 |
| 3273 | 1.174 |
| 3274 | 1.174 |
| 3275 | 1.174 |
| 3276 | 1.174 |
| 3277 | 1.174 |
| 3278 | 1.174 |
| 3279 | 1.174 |
| 3280 | 1.174 |
| 3281 | 1.174 |
| 3282 | 1.174 |
| 3283 | 1.174 |
| 3284 | 1.174 |
| 3285 | 1.174 |
| 3286 | 1.174 |
| 3287 | 1.174 |
| 3288 | 1.174 |
| 3289 | 1.174 |
| 3290 | 1.174 |
| 3291 | 1.174 |
| 3292 | 1.174 |
| 3293 | 1.174 |
| 3294 | 1.174 |
| 3295 | 1.174 |
| 3296 | 1.097 |
| 3297 | 1.097 |
| 3298 | 1.097 |
| 3299 | 1.097 |
| 3300 | 1.097 |
| 3301 | 1.097 |
| 3302 | 1.097 |
| 3303 | 1.097 |
| 3304 | 1.097 |
| 3305 | 1.097 |
| 3306 | 1.097 |
| 3307 | 1.097 |
| 3308 | 1.097 |
| 3309 | 1.097 |
| 3310 | 1.097 |
| 3311 | 1.097 |
| 3312 | 1.097 |
| 3313 | 1.097 |
| 3314 | 1.097 |
| 3315 | 1.097 |
| 3316 | 1.097 |
| 3317 | 1.097 |
| 3318 | 1.097 |
| 3319 | 1.097 |
| 3320 | 1.027 |
| 3321 | 1.027 |
| 3322 | 1.027 |
| 3323 | 1.027 |
| 3324 | 1.027 |
| 3325 | 1.027 |
| 3326 | 1.027 |
| 3327 | 1.027 |
| 3328 | 1.027 |
| 3329 | 1.027 |
| 3330 | 1.027 |
| 3331 | 1.027 |
| 3332 | 1.027 |
| 3333 | 1.027 |
| 3334 | 1.027 |
| 3335 | 1.027 |
| 3336 | 1.027 |
| 3337 | 1.027 |
| 3338 | 1.027 |
| 3339 | 1.027 |
| 3340 | 1.027 |
| 3341 | 1.027 |
| 3342 | 1.027 |
| 3343 | 1.027 |
| 3344 | 1.027 |
| 3345 | 1.027 |
| 3346 | 1.027 |
| 3347 | 1.027 |
| 3348 | 1.027 |
| 3349 | 1.027 |
| 3350 | 1.027 |
| 3351 | 1.027 |
| 3352 | 1.027 |
| 3353 | 1.027 |
| 3354 | 1.027 |
| 3355 | 1.027 |
| 3356 | 1.027 |
| 3357 | 1.027 |
| 3358 | 1.027 |
| 3359 | 1.027 |
| 3360 | 1.027 |
| 3361 | 1.027 |
| 3362 | 1.027 |
| 3363 | 1.027 |
| 3364 | 1.027 |
| 3365 | 1.027 |
| 3366 | 1.027 |
| 3367 | 1.027 |
| 3368 | 1.027 |
| 3369 | 1.027 |
| 3370 | 1.027 |
| 3371 | 1.027 |
| 3372 | 1.027 |
| 3373 | 1.027 |
| 3374 | 0.967 |
| 3375 | 0.967 |
| 3376 | 1.027 |
| 3377 | 0.967 |
| 3378 | 0.967 |
| 3379 | 0.967 |
| 3380 | 0.464 |
| 3381 | 0.464 |
| 3382 | 0.464 |
| 3383 | 0.967 |
| 3384 | 0.967 |
| 3385 | 0.967 |
| 3386 | 0.967 |
| 3387 | 0.464 |
| 3388 | 0.967 |
| 3389 | 0.967 |
| 3390 | 0.464 |
| 3391 | 0.464 |
| 3392 | 0.464 |
| 3393 | 0.464 |
| 3394 | 0.464 |
| 3395 | 0.464 |
| 3396 | 0.464 |
| 3397 | 0.464 |
| 3398 | 0.464 |
| 3399 | 0.464 |
| 3400 | 0.464 |
| 3401 | 0.464 |
| 3402 | 0.464 |
| 3403 | 0.464 |
| 3404 | 0.464 |
| 3405 | 0.464 |
| 3406 | 0.464 |
| 3407 | 0.464 |
| 3408 | 0.464 |
| 3409 | 0.464 |
| 3410 | 0.464 |
| 3411 | 0.464 |
| 3412 | 0.464 |
| 3413 | 0.464 |
| 3414 | 0.464 |
| 3415 | 0.464 |
| 3416 | 0.464 |
| 3417 | 0.464 |
| 3418 | 0.464 |
| 3419 | 0.464 |
| 3420 | 0.348 |
| 3421 | 0.348 |
| 3422 | 0.348 |
| 3423 | 0.348 |
| 3424 | 0.348 |
| 3425 | 0.348 |
| 3426 | 0.348 |
| 3427 | 0.348 |
| 3428 | 0.348 |
| 3429 | 0.348 |
| 3430 | 0.348 |
| 3431 | 0.348 |
| 3432 | 0.348 |
| 3433 | 0.348 |
| 3434 | 0.348 |
| 3435 | 0.348 |
| 3436 | 0.348 |
| 3437 | 0.348 |
| 3438 | 0.348 |
| 3439 | 0.348 |
| 3440 | 0.348 |
| 3441 | 0.348 |
| 3442 | 0.348 |
| 3443 | 0.348 |
| 3444 | 0.348 |
| 3445 | 0.348 |
| 3446 | 0.348 |
| 3447 | 0.348 |
| 3448 | 0.348 |
| 3449 | 0.348 |
| 3450 | 0.348 |
| 3451 | 0.348 |
| 3452 | 0.348 |
| 3453 | 0.348 |
| 3454 | 0.348 |
| 3455 | 0.348 |
| 3456 | 0.348 |
| 3457 | 0.348 |
| 3458 | 0.348 |
| 3459 | 0.348 |
| 3460 | 0.348 |
| 3461 | 0.348 |
| 3462 | 0.348 |
| 3463 | 0.348 |
| 3464 | 0.348 |
| 3465 | 0.348 |
| 3466 | 0.348 |
| 3467 | 0.348 |
| 3468 | 0.348 |
| 3469 | 0.348 |
| 3470 | 0.348 |
| 3471 | 0.348 |
| 3472 | 0.348 |
| 3473 | 0.348 |
| 3474 | 0.348 |
| 3475 | 0.348 |
| 3476 | 0.348 |
| 3477 | 0.348 |
| 3478 | 0.348 |
| 3479 | 0.232 |
| 3480 | 0.232 |
| 3481 | 0.232 |
| 3482 | 0.232 |
| 3483 | 0.232 |
| 3484 | 0.232 |
| 3485 | 0.232 |
| 3486 | 0.232 |
| 3487 | 0.232 |
| 3488 | 0.232 |
| 3489 | 0.232 |
| 3490 | 0.232 |
| 3491 | 0.232 |
| 3492 | 0.232 |
| 3493 | 0.232 |
| 3494 | 0.232 |
| 3495 | 0.232 |
| 3496 | 0.232 |
| 3497 | 0.232 |
| 3498 | 0.232 |
| 3499 | 0.116 |
| 3500 | 0.116 |
| 3501 | 0.116 |
| 3502 | 0.116 |
| 3503 | 0.116 |
| 3504 | 0.116 |
| 3505 | 0.116 |
| 3506 | 0.116 |
| 3507 | 0.116 |
| 3508 | 0.116 |
| 3509 | 0.116 |
| 3510 | 0.116 |
| 3511 | 0.116 |
| 3512 | 0.116 |
| 3513 | 0.116 |
| 3514 | 0.116 |
| 3515 | 0.116 |
| 3516 | 0.116 |
| 3517 | 0.116 |
| 3518 | 0.116 |
| 3519 | 0.116 |
| 3520 | 0.116 |
| 3521 | 0.116 |
| 3522 | 0.116 |
| 3523 | 0.116 |
| 3524 | 0.116 |
| 3525 | 0.116 |
| 3526 | 0 |
| 3527 | 0 |
| 3528 | 0 |
| 3529 | 0 |
| 3530 | 0 |
| 3531 | 0 |
| 3532 | 0 |
| 3533 | 0 |
| 3534 | 0 |
| 3535 | 0 |
| 3536 | 0 |
| 3537 | 0 |
| 3538 | 0 |
| 3539 | 0 |
| 3540 | 0 |
| 3541 | 0 |
| 3542 | 0 |
| 3543 | 0 |
| 3544 | 0 |
| 3545 | 0 |
| 3546 | 0 |
| 3547 | 0 |
| 3548 | 0 |
| 3549 | 0 |
| 3550 | 0 |
| 3551 | 0 |
| 3552 | 0 |
| 3553 | 0 |
| 3554 | 0 |
| 3555 | 0 |
| 3556 | 0 |
| 3557 | 0 |
| 3558 | 0 |
| 3559 | 0 |
| 3560 | 0 |
| 3561 | 0 |
| 3562 | 0 |
| 3563 | 0 |
| 3564 | 0 |
| 3565 | 0 |
| 3566 | 0 |
| 3567 | 0 |
| 3568 | 0 |
| 3569 | 0 |
| 3570 | 0 |
| 3571 | 0 |
| 3572 | 0 |
| 3573 | 0 |
| 3574 | 0 |
| 3575 | 0 |
| 3576 | 0 |
| 3577 | 0 |
| 3578 | 0 |
| 3579 | 0 |
| 3580 | 0 |
| 3581 | 0 |
| 3582 | 0 |
| 3583 | 0 |
| 3584 | 0 |
| 3585 | 0 |
| 3586 | 0 |
| 3587 | 0 |
| 3588 | 0 |
| 3589 | 0 |
| 3590 | 0 |
| 3591 | 0 |
| 3592 | 0 |
| 3593 | 0 |
| 3594 | 0 |
| 3595 | 0 |
| 3596 | 0 |
| 3597 | 0 |
| 3598 | 0 |
| 3599 | 0 |
| 3600 | 0 |
| 3601 | 0 |
| 3602 | 0 |
| 3603 | 0 |
| 3604 | 0 |
| 3605 | 0 |
| 3606 | 0 |
| 3607 | 0 |
| 3608 | 0 |
| 3609 | 0 |